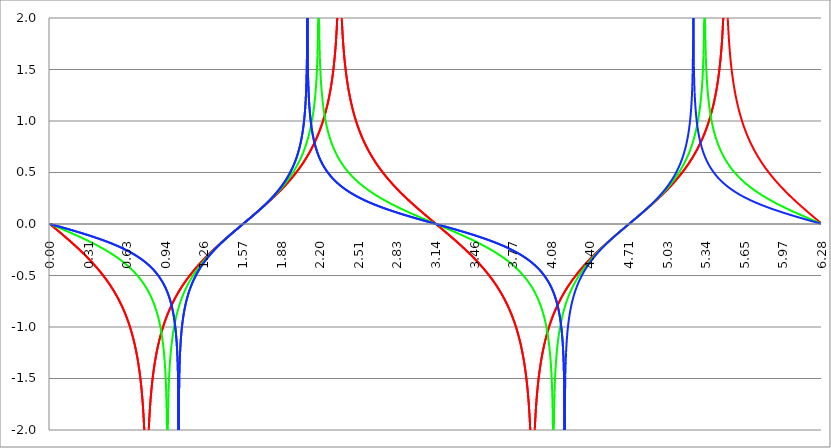
| Category | Series 1 | Series 0 | Series 2 |
|---|---|---|---|
| 0.0 | 0 | 0 | 0 |
| 0.00314159265358979 | -0.003 | -0.002 | -0.001 |
| 0.00628318530717958 | -0.006 | -0.003 | -0.002 |
| 0.00942477796076938 | -0.009 | -0.005 | -0.003 |
| 0.0125663706143592 | -0.013 | -0.006 | -0.004 |
| 0.015707963267949 | -0.016 | -0.008 | -0.005 |
| 0.0188495559215388 | -0.019 | -0.009 | -0.006 |
| 0.0219911485751285 | -0.022 | -0.011 | -0.007 |
| 0.0251327412287183 | -0.025 | -0.013 | -0.008 |
| 0.0282743338823081 | -0.028 | -0.014 | -0.009 |
| 0.0314159265358979 | -0.031 | -0.016 | -0.01 |
| 0.0345575191894877 | -0.035 | -0.017 | -0.012 |
| 0.0376991118430775 | -0.038 | -0.019 | -0.013 |
| 0.0408407044966673 | -0.041 | -0.02 | -0.014 |
| 0.0439822971502571 | -0.044 | -0.022 | -0.015 |
| 0.0471238898038469 | -0.047 | -0.024 | -0.016 |
| 0.0502654824574367 | -0.05 | -0.025 | -0.017 |
| 0.0534070751110265 | -0.054 | -0.027 | -0.018 |
| 0.0565486677646163 | -0.057 | -0.028 | -0.019 |
| 0.059690260418206 | -0.06 | -0.03 | -0.02 |
| 0.0628318530717958 | -0.063 | -0.031 | -0.021 |
| 0.0659734457253856 | -0.066 | -0.033 | -0.022 |
| 0.0691150383789754 | -0.069 | -0.035 | -0.023 |
| 0.0722566310325652 | -0.073 | -0.036 | -0.024 |
| 0.075398223686155 | -0.076 | -0.038 | -0.025 |
| 0.0785398163397448 | -0.079 | -0.039 | -0.026 |
| 0.0816814089933346 | -0.082 | -0.041 | -0.027 |
| 0.0848230016469244 | -0.085 | -0.043 | -0.028 |
| 0.0879645943005142 | -0.088 | -0.044 | -0.029 |
| 0.091106186954104 | -0.092 | -0.046 | -0.03 |
| 0.0942477796076937 | -0.095 | -0.047 | -0.032 |
| 0.0973893722612835 | -0.098 | -0.049 | -0.033 |
| 0.100530964914873 | -0.101 | -0.051 | -0.034 |
| 0.103672557568463 | -0.104 | -0.052 | -0.035 |
| 0.106814150222053 | -0.108 | -0.054 | -0.036 |
| 0.109955742875643 | -0.111 | -0.055 | -0.037 |
| 0.113097335529233 | -0.114 | -0.057 | -0.038 |
| 0.116238928182822 | -0.117 | -0.059 | -0.039 |
| 0.119380520836412 | -0.121 | -0.06 | -0.04 |
| 0.122522113490002 | -0.124 | -0.062 | -0.041 |
| 0.125663706143592 | -0.127 | -0.063 | -0.042 |
| 0.128805298797181 | -0.13 | -0.065 | -0.043 |
| 0.131946891450771 | -0.134 | -0.067 | -0.044 |
| 0.135088484104361 | -0.137 | -0.068 | -0.045 |
| 0.138230076757951 | -0.14 | -0.07 | -0.046 |
| 0.141371669411541 | -0.143 | -0.071 | -0.048 |
| 0.14451326206513 | -0.147 | -0.073 | -0.049 |
| 0.14765485471872 | -0.15 | -0.075 | -0.05 |
| 0.15079644737231 | -0.153 | -0.076 | -0.051 |
| 0.1539380400259 | -0.156 | -0.078 | -0.052 |
| 0.15707963267949 | -0.16 | -0.08 | -0.053 |
| 0.160221225333079 | -0.163 | -0.081 | -0.054 |
| 0.163362817986669 | -0.166 | -0.083 | -0.055 |
| 0.166504410640259 | -0.17 | -0.084 | -0.056 |
| 0.169646003293849 | -0.173 | -0.086 | -0.057 |
| 0.172787595947439 | -0.176 | -0.088 | -0.058 |
| 0.175929188601028 | -0.18 | -0.089 | -0.059 |
| 0.179070781254618 | -0.183 | -0.091 | -0.061 |
| 0.182212373908208 | -0.186 | -0.093 | -0.062 |
| 0.185353966561798 | -0.19 | -0.094 | -0.063 |
| 0.188495559215388 | -0.193 | -0.096 | -0.064 |
| 0.191637151868977 | -0.197 | -0.098 | -0.065 |
| 0.194778744522567 | -0.2 | -0.099 | -0.066 |
| 0.197920337176157 | -0.203 | -0.101 | -0.067 |
| 0.201061929829747 | -0.207 | -0.103 | -0.068 |
| 0.204203522483336 | -0.21 | -0.104 | -0.069 |
| 0.207345115136926 | -0.214 | -0.106 | -0.07 |
| 0.210486707790516 | -0.217 | -0.108 | -0.072 |
| 0.213628300444106 | -0.22 | -0.109 | -0.073 |
| 0.216769893097696 | -0.224 | -0.111 | -0.074 |
| 0.219911485751285 | -0.227 | -0.113 | -0.075 |
| 0.223053078404875 | -0.231 | -0.114 | -0.076 |
| 0.226194671058465 | -0.234 | -0.116 | -0.077 |
| 0.229336263712055 | -0.238 | -0.118 | -0.078 |
| 0.232477856365645 | -0.241 | -0.12 | -0.079 |
| 0.235619449019234 | -0.245 | -0.121 | -0.081 |
| 0.238761041672824 | -0.248 | -0.123 | -0.082 |
| 0.241902634326414 | -0.252 | -0.125 | -0.083 |
| 0.245044226980004 | -0.255 | -0.126 | -0.084 |
| 0.248185819633594 | -0.259 | -0.128 | -0.085 |
| 0.251327412287183 | -0.263 | -0.13 | -0.086 |
| 0.254469004940773 | -0.266 | -0.132 | -0.087 |
| 0.257610597594363 | -0.27 | -0.133 | -0.089 |
| 0.260752190247953 | -0.273 | -0.135 | -0.09 |
| 0.263893782901543 | -0.277 | -0.137 | -0.091 |
| 0.267035375555132 | -0.281 | -0.139 | -0.092 |
| 0.270176968208722 | -0.284 | -0.14 | -0.093 |
| 0.273318560862312 | -0.288 | -0.142 | -0.094 |
| 0.276460153515902 | -0.292 | -0.144 | -0.095 |
| 0.279601746169492 | -0.295 | -0.146 | -0.097 |
| 0.282743338823082 | -0.299 | -0.147 | -0.098 |
| 0.285884931476671 | -0.303 | -0.149 | -0.099 |
| 0.289026524130261 | -0.307 | -0.151 | -0.1 |
| 0.292168116783851 | -0.31 | -0.153 | -0.101 |
| 0.295309709437441 | -0.314 | -0.155 | -0.102 |
| 0.298451302091031 | -0.318 | -0.156 | -0.104 |
| 0.30159289474462 | -0.322 | -0.158 | -0.105 |
| 0.30473448739821 | -0.326 | -0.16 | -0.106 |
| 0.3078760800518 | -0.329 | -0.162 | -0.107 |
| 0.31101767270539 | -0.333 | -0.164 | -0.108 |
| 0.31415926535898 | -0.337 | -0.165 | -0.11 |
| 0.31730085801257 | -0.341 | -0.167 | -0.111 |
| 0.320442450666159 | -0.345 | -0.169 | -0.112 |
| 0.323584043319749 | -0.349 | -0.171 | -0.113 |
| 0.326725635973339 | -0.353 | -0.173 | -0.114 |
| 0.329867228626929 | -0.357 | -0.175 | -0.116 |
| 0.333008821280519 | -0.361 | -0.177 | -0.117 |
| 0.336150413934108 | -0.365 | -0.178 | -0.118 |
| 0.339292006587698 | -0.369 | -0.18 | -0.119 |
| 0.342433599241288 | -0.373 | -0.182 | -0.121 |
| 0.345575191894878 | -0.377 | -0.184 | -0.122 |
| 0.348716784548468 | -0.381 | -0.186 | -0.123 |
| 0.351858377202058 | -0.385 | -0.188 | -0.124 |
| 0.354999969855647 | -0.389 | -0.19 | -0.126 |
| 0.358141562509237 | -0.393 | -0.192 | -0.127 |
| 0.361283155162827 | -0.398 | -0.194 | -0.128 |
| 0.364424747816417 | -0.402 | -0.196 | -0.129 |
| 0.367566340470007 | -0.406 | -0.198 | -0.131 |
| 0.370707933123597 | -0.41 | -0.199 | -0.132 |
| 0.373849525777186 | -0.415 | -0.201 | -0.133 |
| 0.376991118430776 | -0.419 | -0.203 | -0.134 |
| 0.380132711084366 | -0.423 | -0.205 | -0.136 |
| 0.383274303737956 | -0.427 | -0.207 | -0.137 |
| 0.386415896391546 | -0.432 | -0.209 | -0.138 |
| 0.389557489045135 | -0.436 | -0.211 | -0.139 |
| 0.392699081698725 | -0.441 | -0.213 | -0.141 |
| 0.395840674352315 | -0.445 | -0.215 | -0.142 |
| 0.398982267005905 | -0.45 | -0.217 | -0.143 |
| 0.402123859659495 | -0.454 | -0.219 | -0.145 |
| 0.405265452313085 | -0.459 | -0.221 | -0.146 |
| 0.408407044966674 | -0.463 | -0.224 | -0.147 |
| 0.411548637620264 | -0.468 | -0.226 | -0.149 |
| 0.414690230273854 | -0.473 | -0.228 | -0.15 |
| 0.417831822927444 | -0.477 | -0.23 | -0.151 |
| 0.420973415581034 | -0.482 | -0.232 | -0.153 |
| 0.424115008234623 | -0.487 | -0.234 | -0.154 |
| 0.427256600888213 | -0.491 | -0.236 | -0.155 |
| 0.430398193541803 | -0.496 | -0.238 | -0.157 |
| 0.433539786195393 | -0.501 | -0.24 | -0.158 |
| 0.436681378848983 | -0.506 | -0.242 | -0.16 |
| 0.439822971502573 | -0.511 | -0.245 | -0.161 |
| 0.442964564156162 | -0.516 | -0.247 | -0.162 |
| 0.446106156809752 | -0.521 | -0.249 | -0.164 |
| 0.449247749463342 | -0.526 | -0.251 | -0.165 |
| 0.452389342116932 | -0.531 | -0.253 | -0.166 |
| 0.455530934770522 | -0.536 | -0.256 | -0.168 |
| 0.458672527424111 | -0.541 | -0.258 | -0.169 |
| 0.461814120077701 | -0.546 | -0.26 | -0.171 |
| 0.464955712731291 | -0.551 | -0.262 | -0.172 |
| 0.468097305384881 | -0.557 | -0.264 | -0.174 |
| 0.471238898038471 | -0.562 | -0.267 | -0.175 |
| 0.474380490692061 | -0.567 | -0.269 | -0.176 |
| 0.47752208334565 | -0.573 | -0.271 | -0.178 |
| 0.48066367599924 | -0.578 | -0.274 | -0.179 |
| 0.48380526865283 | -0.584 | -0.276 | -0.181 |
| 0.48694686130642 | -0.589 | -0.278 | -0.182 |
| 0.49008845396001 | -0.595 | -0.281 | -0.184 |
| 0.493230046613599 | -0.601 | -0.283 | -0.185 |
| 0.496371639267189 | -0.606 | -0.285 | -0.187 |
| 0.499513231920779 | -0.612 | -0.288 | -0.188 |
| 0.502654824574369 | -0.618 | -0.29 | -0.19 |
| 0.505796417227959 | -0.624 | -0.293 | -0.191 |
| 0.508938009881549 | -0.63 | -0.295 | -0.193 |
| 0.512079602535138 | -0.636 | -0.297 | -0.194 |
| 0.515221195188728 | -0.642 | -0.3 | -0.196 |
| 0.518362787842318 | -0.648 | -0.302 | -0.197 |
| 0.521504380495908 | -0.654 | -0.305 | -0.199 |
| 0.524645973149498 | -0.661 | -0.307 | -0.201 |
| 0.527787565803087 | -0.667 | -0.31 | -0.202 |
| 0.530929158456677 | -0.673 | -0.312 | -0.204 |
| 0.534070751110267 | -0.68 | -0.315 | -0.205 |
| 0.537212343763857 | -0.686 | -0.318 | -0.207 |
| 0.540353936417447 | -0.693 | -0.32 | -0.209 |
| 0.543495529071037 | -0.7 | -0.323 | -0.21 |
| 0.546637121724626 | -0.707 | -0.325 | -0.212 |
| 0.549778714378216 | -0.713 | -0.328 | -0.213 |
| 0.552920307031806 | -0.72 | -0.331 | -0.215 |
| 0.556061899685396 | -0.727 | -0.333 | -0.217 |
| 0.559203492338986 | -0.735 | -0.336 | -0.218 |
| 0.562345084992576 | -0.742 | -0.339 | -0.22 |
| 0.565486677646165 | -0.749 | -0.342 | -0.222 |
| 0.568628270299755 | -0.757 | -0.344 | -0.224 |
| 0.571769862953345 | -0.764 | -0.347 | -0.225 |
| 0.574911455606935 | -0.772 | -0.35 | -0.227 |
| 0.578053048260525 | -0.779 | -0.353 | -0.229 |
| 0.581194640914114 | -0.787 | -0.356 | -0.23 |
| 0.584336233567704 | -0.795 | -0.359 | -0.232 |
| 0.587477826221294 | -0.803 | -0.361 | -0.234 |
| 0.590619418874884 | -0.812 | -0.364 | -0.236 |
| 0.593761011528474 | -0.82 | -0.367 | -0.238 |
| 0.596902604182064 | -0.828 | -0.37 | -0.239 |
| 0.600044196835653 | -0.837 | -0.373 | -0.241 |
| 0.603185789489243 | -0.846 | -0.376 | -0.243 |
| 0.606327382142833 | -0.855 | -0.379 | -0.245 |
| 0.609468974796423 | -0.864 | -0.382 | -0.247 |
| 0.612610567450013 | -0.873 | -0.386 | -0.249 |
| 0.615752160103602 | -0.882 | -0.389 | -0.25 |
| 0.618893752757192 | -0.892 | -0.392 | -0.252 |
| 0.622035345410782 | -0.901 | -0.395 | -0.254 |
| 0.625176938064372 | -0.911 | -0.398 | -0.256 |
| 0.628318530717962 | -0.921 | -0.401 | -0.258 |
| 0.631460123371551 | -0.932 | -0.405 | -0.26 |
| 0.634601716025141 | -0.942 | -0.408 | -0.262 |
| 0.637743308678731 | -0.953 | -0.411 | -0.264 |
| 0.640884901332321 | -0.964 | -0.415 | -0.266 |
| 0.644026493985911 | -0.975 | -0.418 | -0.268 |
| 0.647168086639501 | -0.986 | -0.422 | -0.27 |
| 0.65030967929309 | -0.998 | -0.425 | -0.272 |
| 0.65345127194668 | -1.01 | -0.429 | -0.274 |
| 0.65659286460027 | -1.022 | -0.432 | -0.276 |
| 0.65973445725386 | -1.034 | -0.436 | -0.278 |
| 0.66287604990745 | -1.047 | -0.439 | -0.28 |
| 0.666017642561039 | -1.06 | -0.443 | -0.283 |
| 0.669159235214629 | -1.074 | -0.447 | -0.285 |
| 0.672300827868219 | -1.088 | -0.45 | -0.287 |
| 0.675442420521809 | -1.102 | -0.454 | -0.289 |
| 0.678584013175399 | -1.116 | -0.458 | -0.291 |
| 0.681725605828989 | -1.131 | -0.462 | -0.293 |
| 0.684867198482578 | -1.147 | -0.466 | -0.296 |
| 0.688008791136168 | -1.163 | -0.47 | -0.298 |
| 0.691150383789758 | -1.179 | -0.474 | -0.3 |
| 0.694291976443348 | -1.196 | -0.478 | -0.302 |
| 0.697433569096938 | -1.214 | -0.482 | -0.305 |
| 0.700575161750528 | -1.232 | -0.486 | -0.307 |
| 0.703716754404117 | -1.251 | -0.49 | -0.309 |
| 0.706858347057707 | -1.271 | -0.494 | -0.312 |
| 0.709999939711297 | -1.292 | -0.499 | -0.314 |
| 0.713141532364887 | -1.313 | -0.503 | -0.317 |
| 0.716283125018477 | -1.335 | -0.508 | -0.319 |
| 0.719424717672066 | -1.359 | -0.512 | -0.322 |
| 0.722566310325656 | -1.383 | -0.517 | -0.324 |
| 0.725707902979246 | -1.409 | -0.521 | -0.327 |
| 0.728849495632836 | -1.436 | -0.526 | -0.329 |
| 0.731991088286426 | -1.464 | -0.531 | -0.332 |
| 0.735132680940016 | -1.495 | -0.535 | -0.334 |
| 0.738274273593605 | -1.527 | -0.54 | -0.337 |
| 0.741415866247195 | -1.562 | -0.545 | -0.34 |
| 0.744557458900785 | -1.599 | -0.55 | -0.342 |
| 0.747699051554375 | -1.639 | -0.555 | -0.345 |
| 0.750840644207965 | -1.682 | -0.56 | -0.348 |
| 0.753982236861554 | -1.73 | -0.566 | -0.351 |
| 0.757123829515144 | -1.783 | -0.571 | -0.353 |
| 0.760265422168734 | -1.842 | -0.576 | -0.356 |
| 0.763407014822324 | -1.908 | -0.582 | -0.359 |
| 0.766548607475914 | -1.986 | -0.588 | -0.362 |
| 0.769690200129504 | -2.077 | -0.593 | -0.365 |
| 0.772831792783093 | -2.188 | -0.599 | -0.368 |
| 0.775973385436683 | -2.332 | -0.605 | -0.371 |
| 0.779114978090273 | -2.535 | -0.611 | -0.374 |
| 0.782256570743863 | -2.882 | -0.617 | -0.377 |
| 0.785398163397453 | -16.524 | -0.623 | -0.38 |
| 0.788539756051042 | -2.882 | -0.63 | -0.383 |
| 0.791681348704632 | -2.535 | -0.636 | -0.387 |
| 0.794822941358222 | -2.332 | -0.643 | -0.39 |
| 0.797964534011812 | -2.188 | -0.649 | -0.393 |
| 0.801106126665402 | -2.077 | -0.656 | -0.396 |
| 0.804247719318992 | -1.986 | -0.663 | -0.4 |
| 0.807389311972581 | -1.908 | -0.67 | -0.403 |
| 0.810530904626171 | -1.842 | -0.678 | -0.407 |
| 0.813672497279761 | -1.783 | -0.685 | -0.41 |
| 0.816814089933351 | -1.73 | -0.693 | -0.414 |
| 0.819955682586941 | -1.682 | -0.701 | -0.417 |
| 0.823097275240531 | -1.639 | -0.709 | -0.421 |
| 0.82623886789412 | -1.599 | -0.717 | -0.425 |
| 0.82938046054771 | -1.562 | -0.725 | -0.429 |
| 0.8325220532013 | -1.527 | -0.734 | -0.432 |
| 0.83566364585489 | -1.495 | -0.743 | -0.436 |
| 0.83880523850848 | -1.464 | -0.752 | -0.44 |
| 0.841946831162069 | -1.436 | -0.761 | -0.444 |
| 0.845088423815659 | -1.409 | -0.771 | -0.448 |
| 0.848230016469249 | -1.383 | -0.781 | -0.453 |
| 0.851371609122839 | -1.359 | -0.791 | -0.457 |
| 0.854513201776429 | -1.335 | -0.802 | -0.461 |
| 0.857654794430019 | -1.313 | -0.813 | -0.465 |
| 0.860796387083608 | -1.292 | -0.824 | -0.47 |
| 0.863937979737198 | -1.271 | -0.835 | -0.474 |
| 0.867079572390788 | -1.251 | -0.847 | -0.479 |
| 0.870221165044378 | -1.232 | -0.86 | -0.484 |
| 0.873362757697968 | -1.214 | -0.873 | -0.489 |
| 0.876504350351557 | -1.196 | -0.886 | -0.493 |
| 0.879645943005147 | -1.179 | -0.901 | -0.498 |
| 0.882787535658737 | -1.163 | -0.915 | -0.503 |
| 0.885929128312327 | -1.147 | -0.93 | -0.509 |
| 0.889070720965917 | -1.131 | -0.947 | -0.514 |
| 0.892212313619507 | -1.116 | -0.963 | -0.519 |
| 0.895353906273096 | -1.102 | -0.981 | -0.525 |
| 0.898495498926686 | -1.088 | -1 | -0.53 |
| 0.901637091580276 | -1.074 | -1.02 | -0.536 |
| 0.904778684233866 | -1.06 | -1.041 | -0.542 |
| 0.907920276887456 | -1.047 | -1.063 | -0.548 |
| 0.911061869541045 | -1.034 | -1.087 | -0.554 |
| 0.914203462194635 | -1.022 | -1.112 | -0.561 |
| 0.917345054848225 | -1.01 | -1.14 | -0.567 |
| 0.920486647501815 | -0.998 | -1.17 | -0.574 |
| 0.923628240155405 | -0.986 | -1.203 | -0.581 |
| 0.926769832808995 | -0.975 | -1.24 | -0.588 |
| 0.929911425462584 | -0.964 | -1.281 | -0.595 |
| 0.933053018116174 | -0.953 | -1.327 | -0.602 |
| 0.936194610769764 | -0.942 | -1.38 | -0.61 |
| 0.939336203423354 | -0.932 | -1.444 | -0.618 |
| 0.942477796076944 | -0.921 | -1.521 | -0.626 |
| 0.945619388730533 | -0.911 | -1.619 | -0.634 |
| 0.948760981384123 | -0.901 | -1.757 | -0.643 |
| 0.951902574037713 | -0.892 | -1.988 | -0.652 |
| 0.955044166691303 | -0.882 | -2.881 | -0.661 |
| 0.958185759344893 | -0.873 | -2.048 | -0.671 |
| 0.961327351998483 | -0.864 | -1.787 | -0.68 |
| 0.964468944652072 | -0.855 | -1.638 | -0.691 |
| 0.967610537305662 | -0.846 | -1.533 | -0.701 |
| 0.970752129959252 | -0.837 | -1.452 | -0.713 |
| 0.973893722612842 | -0.828 | -1.386 | -0.724 |
| 0.977035315266432 | -0.82 | -1.33 | -0.736 |
| 0.980176907920022 | -0.812 | -1.282 | -0.749 |
| 0.983318500573611 | -0.803 | -1.24 | -0.763 |
| 0.986460093227201 | -0.795 | -1.202 | -0.777 |
| 0.989601685880791 | -0.787 | -1.167 | -0.792 |
| 0.992743278534381 | -0.779 | -1.136 | -0.807 |
| 0.995884871187971 | -0.772 | -1.107 | -0.824 |
| 0.99902646384156 | -0.764 | -1.08 | -0.842 |
| 1.00216805649515 | -0.757 | -1.055 | -0.861 |
| 1.00530964914874 | -0.749 | -1.032 | -0.881 |
| 1.00845124180233 | -0.742 | -1.01 | -0.903 |
| 1.01159283445592 | -0.735 | -0.989 | -0.927 |
| 1.01473442710951 | -0.727 | -0.969 | -0.953 |
| 1.017876019763099 | -0.72 | -0.951 | -0.982 |
| 1.021017612416689 | -0.713 | -0.933 | -1.014 |
| 1.02415920507028 | -0.707 | -0.916 | -1.051 |
| 1.027300797723869 | -0.7 | -0.9 | -1.093 |
| 1.030442390377459 | -0.693 | -0.884 | -1.142 |
| 1.033583983031048 | -0.686 | -0.869 | -1.201 |
| 1.036725575684638 | -0.68 | -0.855 | -1.276 |
| 1.039867168338228 | -0.673 | -0.841 | -1.379 |
| 1.043008760991818 | -0.667 | -0.828 | -1.54 |
| 1.046150353645408 | -0.661 | -0.815 | -3 |
| 1.049291946298998 | -0.654 | -0.802 | -1.739 |
| 1.052433538952587 | -0.648 | -0.79 | -1.474 |
| 1.055575131606177 | -0.642 | -0.778 | -1.338 |
| 1.058716724259767 | -0.636 | -0.767 | -1.245 |
| 1.061858316913357 | -0.63 | -0.756 | -1.175 |
| 1.064999909566947 | -0.624 | -0.745 | -1.118 |
| 1.068141502220536 | -0.618 | -0.735 | -1.071 |
| 1.071283094874126 | -0.612 | -0.724 | -1.03 |
| 1.074424687527716 | -0.606 | -0.714 | -0.994 |
| 1.077566280181306 | -0.601 | -0.705 | -0.962 |
| 1.080707872834896 | -0.595 | -0.695 | -0.933 |
| 1.083849465488486 | -0.589 | -0.686 | -0.907 |
| 1.086991058142075 | -0.584 | -0.677 | -0.882 |
| 1.090132650795665 | -0.578 | -0.668 | -0.86 |
| 1.093274243449255 | -0.573 | -0.659 | -0.839 |
| 1.096415836102845 | -0.567 | -0.651 | -0.819 |
| 1.099557428756435 | -0.562 | -0.643 | -0.801 |
| 1.102699021410025 | -0.557 | -0.635 | -0.783 |
| 1.105840614063614 | -0.551 | -0.627 | -0.767 |
| 1.108982206717204 | -0.546 | -0.619 | -0.751 |
| 1.112123799370794 | -0.541 | -0.611 | -0.736 |
| 1.115265392024384 | -0.536 | -0.603 | -0.722 |
| 1.118406984677974 | -0.531 | -0.596 | -0.709 |
| 1.121548577331563 | -0.526 | -0.589 | -0.696 |
| 1.124690169985153 | -0.521 | -0.582 | -0.683 |
| 1.127831762638743 | -0.516 | -0.574 | -0.671 |
| 1.130973355292333 | -0.511 | -0.568 | -0.659 |
| 1.134114947945923 | -0.506 | -0.561 | -0.648 |
| 1.137256540599513 | -0.501 | -0.554 | -0.637 |
| 1.140398133253102 | -0.496 | -0.547 | -0.627 |
| 1.143539725906692 | -0.491 | -0.541 | -0.616 |
| 1.146681318560282 | -0.487 | -0.534 | -0.607 |
| 1.149822911213872 | -0.482 | -0.528 | -0.597 |
| 1.152964503867462 | -0.477 | -0.522 | -0.588 |
| 1.156106096521051 | -0.473 | -0.516 | -0.579 |
| 1.159247689174641 | -0.468 | -0.51 | -0.57 |
| 1.162389281828231 | -0.463 | -0.504 | -0.561 |
| 1.165530874481821 | -0.459 | -0.498 | -0.553 |
| 1.168672467135411 | -0.454 | -0.492 | -0.544 |
| 1.171814059789001 | -0.45 | -0.486 | -0.536 |
| 1.17495565244259 | -0.445 | -0.48 | -0.529 |
| 1.17809724509618 | -0.441 | -0.475 | -0.521 |
| 1.18123883774977 | -0.436 | -0.469 | -0.513 |
| 1.18438043040336 | -0.432 | -0.464 | -0.506 |
| 1.18752202305695 | -0.427 | -0.458 | -0.499 |
| 1.190663615710539 | -0.423 | -0.453 | -0.492 |
| 1.193805208364129 | -0.419 | -0.447 | -0.485 |
| 1.19694680101772 | -0.415 | -0.442 | -0.478 |
| 1.200088393671309 | -0.41 | -0.437 | -0.471 |
| 1.203229986324899 | -0.406 | -0.432 | -0.465 |
| 1.206371578978489 | -0.402 | -0.427 | -0.458 |
| 1.209513171632078 | -0.398 | -0.422 | -0.452 |
| 1.212654764285668 | -0.393 | -0.417 | -0.446 |
| 1.215796356939258 | -0.389 | -0.412 | -0.44 |
| 1.218937949592848 | -0.385 | -0.407 | -0.434 |
| 1.222079542246438 | -0.381 | -0.402 | -0.428 |
| 1.225221134900027 | -0.377 | -0.397 | -0.422 |
| 1.228362727553617 | -0.373 | -0.392 | -0.416 |
| 1.231504320207207 | -0.369 | -0.388 | -0.411 |
| 1.234645912860797 | -0.365 | -0.383 | -0.405 |
| 1.237787505514387 | -0.361 | -0.378 | -0.399 |
| 1.240929098167977 | -0.357 | -0.374 | -0.394 |
| 1.244070690821566 | -0.353 | -0.369 | -0.389 |
| 1.247212283475156 | -0.349 | -0.365 | -0.383 |
| 1.250353876128746 | -0.345 | -0.36 | -0.378 |
| 1.253495468782336 | -0.341 | -0.356 | -0.373 |
| 1.256637061435926 | -0.337 | -0.351 | -0.368 |
| 1.259778654089515 | -0.333 | -0.347 | -0.363 |
| 1.262920246743105 | -0.329 | -0.342 | -0.358 |
| 1.266061839396695 | -0.326 | -0.338 | -0.353 |
| 1.269203432050285 | -0.322 | -0.334 | -0.348 |
| 1.272345024703875 | -0.318 | -0.33 | -0.343 |
| 1.275486617357465 | -0.314 | -0.325 | -0.338 |
| 1.278628210011054 | -0.31 | -0.321 | -0.334 |
| 1.281769802664644 | -0.307 | -0.317 | -0.329 |
| 1.284911395318234 | -0.303 | -0.313 | -0.324 |
| 1.288052987971824 | -0.299 | -0.309 | -0.32 |
| 1.291194580625414 | -0.295 | -0.305 | -0.315 |
| 1.294336173279003 | -0.292 | -0.301 | -0.311 |
| 1.297477765932593 | -0.288 | -0.297 | -0.306 |
| 1.300619358586183 | -0.284 | -0.293 | -0.302 |
| 1.303760951239773 | -0.281 | -0.289 | -0.297 |
| 1.306902543893363 | -0.277 | -0.285 | -0.293 |
| 1.310044136546953 | -0.273 | -0.281 | -0.289 |
| 1.313185729200542 | -0.27 | -0.277 | -0.284 |
| 1.316327321854132 | -0.266 | -0.273 | -0.28 |
| 1.319468914507722 | -0.263 | -0.269 | -0.276 |
| 1.322610507161312 | -0.259 | -0.265 | -0.272 |
| 1.325752099814902 | -0.255 | -0.261 | -0.268 |
| 1.328893692468491 | -0.252 | -0.258 | -0.264 |
| 1.332035285122081 | -0.248 | -0.254 | -0.26 |
| 1.335176877775671 | -0.245 | -0.25 | -0.256 |
| 1.338318470429261 | -0.241 | -0.246 | -0.252 |
| 1.341460063082851 | -0.238 | -0.243 | -0.248 |
| 1.344601655736441 | -0.234 | -0.239 | -0.244 |
| 1.34774324839003 | -0.231 | -0.235 | -0.24 |
| 1.35088484104362 | -0.227 | -0.231 | -0.236 |
| 1.35402643369721 | -0.224 | -0.228 | -0.232 |
| 1.3571680263508 | -0.22 | -0.224 | -0.228 |
| 1.36030961900439 | -0.217 | -0.221 | -0.224 |
| 1.363451211657979 | -0.214 | -0.217 | -0.22 |
| 1.36659280431157 | -0.21 | -0.213 | -0.217 |
| 1.369734396965159 | -0.207 | -0.21 | -0.213 |
| 1.372875989618749 | -0.203 | -0.206 | -0.209 |
| 1.376017582272339 | -0.2 | -0.203 | -0.206 |
| 1.379159174925929 | -0.197 | -0.199 | -0.202 |
| 1.382300767579518 | -0.193 | -0.196 | -0.198 |
| 1.385442360233108 | -0.19 | -0.192 | -0.195 |
| 1.388583952886698 | -0.186 | -0.189 | -0.191 |
| 1.391725545540288 | -0.183 | -0.185 | -0.187 |
| 1.394867138193878 | -0.18 | -0.182 | -0.184 |
| 1.398008730847468 | -0.176 | -0.178 | -0.18 |
| 1.401150323501057 | -0.173 | -0.175 | -0.177 |
| 1.404291916154647 | -0.17 | -0.171 | -0.173 |
| 1.407433508808237 | -0.166 | -0.168 | -0.17 |
| 1.410575101461827 | -0.163 | -0.165 | -0.166 |
| 1.413716694115417 | -0.16 | -0.161 | -0.163 |
| 1.416858286769006 | -0.156 | -0.158 | -0.159 |
| 1.419999879422596 | -0.153 | -0.154 | -0.156 |
| 1.423141472076186 | -0.15 | -0.151 | -0.152 |
| 1.426283064729776 | -0.147 | -0.148 | -0.149 |
| 1.429424657383366 | -0.143 | -0.144 | -0.145 |
| 1.432566250036956 | -0.14 | -0.141 | -0.142 |
| 1.435707842690545 | -0.137 | -0.138 | -0.139 |
| 1.438849435344135 | -0.134 | -0.134 | -0.135 |
| 1.441991027997725 | -0.13 | -0.131 | -0.132 |
| 1.445132620651315 | -0.127 | -0.128 | -0.128 |
| 1.448274213304905 | -0.124 | -0.124 | -0.125 |
| 1.451415805958494 | -0.121 | -0.121 | -0.122 |
| 1.454557398612084 | -0.117 | -0.118 | -0.118 |
| 1.457698991265674 | -0.114 | -0.115 | -0.115 |
| 1.460840583919264 | -0.111 | -0.111 | -0.112 |
| 1.463982176572854 | -0.108 | -0.108 | -0.108 |
| 1.467123769226444 | -0.104 | -0.105 | -0.105 |
| 1.470265361880033 | -0.101 | -0.102 | -0.102 |
| 1.473406954533623 | -0.098 | -0.098 | -0.099 |
| 1.476548547187213 | -0.095 | -0.095 | -0.095 |
| 1.479690139840803 | -0.092 | -0.092 | -0.092 |
| 1.482831732494393 | -0.088 | -0.089 | -0.089 |
| 1.485973325147982 | -0.085 | -0.085 | -0.086 |
| 1.489114917801572 | -0.082 | -0.082 | -0.082 |
| 1.492256510455162 | -0.079 | -0.079 | -0.079 |
| 1.495398103108752 | -0.076 | -0.076 | -0.076 |
| 1.498539695762342 | -0.073 | -0.073 | -0.073 |
| 1.501681288415932 | -0.069 | -0.069 | -0.07 |
| 1.504822881069521 | -0.066 | -0.066 | -0.066 |
| 1.507964473723111 | -0.063 | -0.063 | -0.063 |
| 1.511106066376701 | -0.06 | -0.06 | -0.06 |
| 1.514247659030291 | -0.057 | -0.057 | -0.057 |
| 1.517389251683881 | -0.054 | -0.054 | -0.054 |
| 1.520530844337471 | -0.05 | -0.05 | -0.05 |
| 1.52367243699106 | -0.047 | -0.047 | -0.047 |
| 1.52681402964465 | -0.044 | -0.044 | -0.044 |
| 1.52995562229824 | -0.041 | -0.041 | -0.041 |
| 1.53309721495183 | -0.038 | -0.038 | -0.038 |
| 1.53623880760542 | -0.035 | -0.035 | -0.035 |
| 1.539380400259009 | -0.031 | -0.031 | -0.031 |
| 1.542521992912599 | -0.028 | -0.028 | -0.028 |
| 1.545663585566189 | -0.025 | -0.025 | -0.025 |
| 1.548805178219779 | -0.022 | -0.022 | -0.022 |
| 1.551946770873369 | -0.019 | -0.019 | -0.019 |
| 1.555088363526959 | -0.016 | -0.016 | -0.016 |
| 1.558229956180548 | -0.013 | -0.013 | -0.013 |
| 1.561371548834138 | -0.009 | -0.009 | -0.009 |
| 1.564513141487728 | -0.006 | -0.006 | -0.006 |
| 1.567654734141318 | -0.003 | -0.003 | -0.003 |
| 1.570796326794908 | 0 | 0 | 0 |
| 1.573937919448497 | 0.003 | 0.003 | 0.003 |
| 1.577079512102087 | 0.006 | 0.006 | 0.006 |
| 1.580221104755677 | 0.009 | 0.009 | 0.009 |
| 1.583362697409267 | 0.013 | 0.013 | 0.013 |
| 1.586504290062857 | 0.016 | 0.016 | 0.016 |
| 1.589645882716447 | 0.019 | 0.019 | 0.019 |
| 1.592787475370036 | 0.022 | 0.022 | 0.022 |
| 1.595929068023626 | 0.025 | 0.025 | 0.025 |
| 1.599070660677216 | 0.028 | 0.028 | 0.028 |
| 1.602212253330806 | 0.031 | 0.031 | 0.031 |
| 1.605353845984396 | 0.035 | 0.035 | 0.035 |
| 1.608495438637985 | 0.038 | 0.038 | 0.038 |
| 1.611637031291575 | 0.041 | 0.041 | 0.041 |
| 1.614778623945165 | 0.044 | 0.044 | 0.044 |
| 1.617920216598755 | 0.047 | 0.047 | 0.047 |
| 1.621061809252345 | 0.05 | 0.05 | 0.05 |
| 1.624203401905935 | 0.054 | 0.054 | 0.054 |
| 1.627344994559524 | 0.057 | 0.057 | 0.057 |
| 1.630486587213114 | 0.06 | 0.06 | 0.06 |
| 1.633628179866704 | 0.063 | 0.063 | 0.063 |
| 1.636769772520294 | 0.066 | 0.066 | 0.066 |
| 1.639911365173884 | 0.069 | 0.069 | 0.07 |
| 1.643052957827473 | 0.073 | 0.073 | 0.073 |
| 1.646194550481063 | 0.076 | 0.076 | 0.076 |
| 1.649336143134653 | 0.079 | 0.079 | 0.079 |
| 1.652477735788243 | 0.082 | 0.082 | 0.082 |
| 1.655619328441833 | 0.085 | 0.085 | 0.086 |
| 1.658760921095423 | 0.088 | 0.089 | 0.089 |
| 1.661902513749012 | 0.092 | 0.092 | 0.092 |
| 1.665044106402602 | 0.095 | 0.095 | 0.095 |
| 1.668185699056192 | 0.098 | 0.098 | 0.099 |
| 1.671327291709782 | 0.101 | 0.102 | 0.102 |
| 1.674468884363372 | 0.104 | 0.105 | 0.105 |
| 1.677610477016961 | 0.108 | 0.108 | 0.108 |
| 1.680752069670551 | 0.111 | 0.111 | 0.112 |
| 1.683893662324141 | 0.114 | 0.115 | 0.115 |
| 1.687035254977731 | 0.117 | 0.118 | 0.118 |
| 1.690176847631321 | 0.121 | 0.121 | 0.122 |
| 1.693318440284911 | 0.124 | 0.124 | 0.125 |
| 1.6964600329385 | 0.127 | 0.128 | 0.128 |
| 1.69960162559209 | 0.13 | 0.131 | 0.132 |
| 1.70274321824568 | 0.134 | 0.134 | 0.135 |
| 1.70588481089927 | 0.137 | 0.138 | 0.139 |
| 1.70902640355286 | 0.14 | 0.141 | 0.142 |
| 1.712167996206449 | 0.143 | 0.144 | 0.145 |
| 1.715309588860039 | 0.147 | 0.148 | 0.149 |
| 1.71845118151363 | 0.15 | 0.151 | 0.152 |
| 1.721592774167219 | 0.153 | 0.154 | 0.156 |
| 1.724734366820809 | 0.156 | 0.158 | 0.159 |
| 1.727875959474399 | 0.16 | 0.161 | 0.163 |
| 1.731017552127988 | 0.163 | 0.165 | 0.166 |
| 1.734159144781578 | 0.166 | 0.168 | 0.17 |
| 1.737300737435168 | 0.17 | 0.171 | 0.173 |
| 1.740442330088758 | 0.173 | 0.175 | 0.177 |
| 1.743583922742348 | 0.176 | 0.178 | 0.18 |
| 1.746725515395937 | 0.18 | 0.182 | 0.184 |
| 1.749867108049527 | 0.183 | 0.185 | 0.187 |
| 1.753008700703117 | 0.186 | 0.189 | 0.191 |
| 1.756150293356707 | 0.19 | 0.192 | 0.195 |
| 1.759291886010297 | 0.193 | 0.196 | 0.198 |
| 1.762433478663887 | 0.197 | 0.199 | 0.202 |
| 1.765575071317476 | 0.2 | 0.203 | 0.206 |
| 1.768716663971066 | 0.203 | 0.206 | 0.209 |
| 1.771858256624656 | 0.207 | 0.21 | 0.213 |
| 1.774999849278246 | 0.21 | 0.213 | 0.217 |
| 1.778141441931836 | 0.214 | 0.217 | 0.22 |
| 1.781283034585426 | 0.217 | 0.221 | 0.224 |
| 1.784424627239015 | 0.22 | 0.224 | 0.228 |
| 1.787566219892605 | 0.224 | 0.228 | 0.232 |
| 1.790707812546195 | 0.227 | 0.231 | 0.236 |
| 1.793849405199785 | 0.231 | 0.235 | 0.24 |
| 1.796990997853375 | 0.234 | 0.239 | 0.244 |
| 1.800132590506964 | 0.238 | 0.243 | 0.248 |
| 1.803274183160554 | 0.241 | 0.246 | 0.252 |
| 1.806415775814144 | 0.245 | 0.25 | 0.256 |
| 1.809557368467734 | 0.248 | 0.254 | 0.26 |
| 1.812698961121324 | 0.252 | 0.258 | 0.264 |
| 1.815840553774914 | 0.255 | 0.261 | 0.268 |
| 1.818982146428503 | 0.259 | 0.265 | 0.272 |
| 1.822123739082093 | 0.263 | 0.269 | 0.276 |
| 1.825265331735683 | 0.266 | 0.273 | 0.28 |
| 1.828406924389273 | 0.27 | 0.277 | 0.284 |
| 1.831548517042863 | 0.273 | 0.281 | 0.289 |
| 1.834690109696452 | 0.277 | 0.285 | 0.293 |
| 1.837831702350042 | 0.281 | 0.289 | 0.297 |
| 1.840973295003632 | 0.284 | 0.293 | 0.302 |
| 1.844114887657222 | 0.288 | 0.297 | 0.306 |
| 1.847256480310812 | 0.292 | 0.301 | 0.311 |
| 1.850398072964402 | 0.295 | 0.305 | 0.315 |
| 1.853539665617991 | 0.299 | 0.309 | 0.32 |
| 1.856681258271581 | 0.303 | 0.313 | 0.324 |
| 1.859822850925171 | 0.307 | 0.317 | 0.329 |
| 1.862964443578761 | 0.31 | 0.321 | 0.334 |
| 1.866106036232351 | 0.314 | 0.325 | 0.338 |
| 1.86924762888594 | 0.318 | 0.33 | 0.343 |
| 1.87238922153953 | 0.322 | 0.334 | 0.348 |
| 1.87553081419312 | 0.326 | 0.338 | 0.353 |
| 1.87867240684671 | 0.329 | 0.342 | 0.358 |
| 1.8818139995003 | 0.333 | 0.347 | 0.363 |
| 1.88495559215389 | 0.337 | 0.351 | 0.368 |
| 1.888097184807479 | 0.341 | 0.356 | 0.373 |
| 1.891238777461069 | 0.345 | 0.36 | 0.378 |
| 1.89438037011466 | 0.349 | 0.365 | 0.383 |
| 1.897521962768249 | 0.353 | 0.369 | 0.389 |
| 1.900663555421839 | 0.357 | 0.374 | 0.394 |
| 1.903805148075429 | 0.361 | 0.378 | 0.399 |
| 1.906946740729018 | 0.365 | 0.383 | 0.405 |
| 1.910088333382608 | 0.369 | 0.388 | 0.411 |
| 1.913229926036198 | 0.373 | 0.392 | 0.416 |
| 1.916371518689788 | 0.377 | 0.397 | 0.422 |
| 1.919513111343378 | 0.381 | 0.402 | 0.428 |
| 1.922654703996967 | 0.385 | 0.407 | 0.434 |
| 1.925796296650557 | 0.389 | 0.412 | 0.44 |
| 1.928937889304147 | 0.393 | 0.417 | 0.446 |
| 1.932079481957737 | 0.398 | 0.422 | 0.452 |
| 1.935221074611327 | 0.402 | 0.427 | 0.458 |
| 1.938362667264917 | 0.406 | 0.432 | 0.465 |
| 1.941504259918506 | 0.41 | 0.437 | 0.471 |
| 1.944645852572096 | 0.415 | 0.442 | 0.478 |
| 1.947787445225686 | 0.419 | 0.447 | 0.485 |
| 1.950929037879276 | 0.423 | 0.453 | 0.492 |
| 1.954070630532866 | 0.427 | 0.458 | 0.499 |
| 1.957212223186455 | 0.432 | 0.464 | 0.506 |
| 1.960353815840045 | 0.436 | 0.469 | 0.513 |
| 1.963495408493635 | 0.441 | 0.475 | 0.521 |
| 1.966637001147225 | 0.445 | 0.48 | 0.529 |
| 1.969778593800815 | 0.45 | 0.486 | 0.536 |
| 1.972920186454405 | 0.454 | 0.492 | 0.544 |
| 1.976061779107994 | 0.459 | 0.498 | 0.553 |
| 1.979203371761584 | 0.463 | 0.504 | 0.561 |
| 1.982344964415174 | 0.468 | 0.51 | 0.57 |
| 1.985486557068764 | 0.473 | 0.516 | 0.579 |
| 1.988628149722354 | 0.477 | 0.522 | 0.588 |
| 1.991769742375943 | 0.482 | 0.528 | 0.597 |
| 1.994911335029533 | 0.487 | 0.534 | 0.607 |
| 1.998052927683123 | 0.491 | 0.541 | 0.616 |
| 2.001194520336712 | 0.496 | 0.547 | 0.627 |
| 2.004336112990302 | 0.501 | 0.554 | 0.637 |
| 2.007477705643892 | 0.506 | 0.561 | 0.648 |
| 2.010619298297482 | 0.511 | 0.568 | 0.659 |
| 2.013760890951071 | 0.516 | 0.574 | 0.671 |
| 2.016902483604661 | 0.521 | 0.582 | 0.683 |
| 2.02004407625825 | 0.526 | 0.589 | 0.696 |
| 2.02318566891184 | 0.531 | 0.596 | 0.709 |
| 2.02632726156543 | 0.536 | 0.603 | 0.722 |
| 2.029468854219019 | 0.541 | 0.611 | 0.736 |
| 2.032610446872609 | 0.546 | 0.619 | 0.751 |
| 2.035752039526198 | 0.551 | 0.627 | 0.767 |
| 2.038893632179788 | 0.557 | 0.635 | 0.783 |
| 2.042035224833378 | 0.562 | 0.643 | 0.801 |
| 2.045176817486967 | 0.567 | 0.651 | 0.819 |
| 2.048318410140557 | 0.573 | 0.659 | 0.839 |
| 2.051460002794146 | 0.578 | 0.668 | 0.86 |
| 2.054601595447736 | 0.584 | 0.677 | 0.882 |
| 2.057743188101325 | 0.589 | 0.686 | 0.907 |
| 2.060884780754915 | 0.595 | 0.695 | 0.933 |
| 2.064026373408505 | 0.601 | 0.705 | 0.962 |
| 2.067167966062094 | 0.606 | 0.714 | 0.994 |
| 2.070309558715684 | 0.612 | 0.724 | 1.03 |
| 2.073451151369273 | 0.618 | 0.735 | 1.071 |
| 2.076592744022863 | 0.624 | 0.745 | 1.118 |
| 2.079734336676452 | 0.63 | 0.756 | 1.175 |
| 2.082875929330042 | 0.636 | 0.767 | 1.245 |
| 2.086017521983632 | 0.642 | 0.778 | 1.338 |
| 2.089159114637221 | 0.648 | 0.79 | 1.474 |
| 2.092300707290811 | 0.654 | 0.802 | 1.739 |
| 2.095442299944401 | 0.661 | 0.815 | 3 |
| 2.09858389259799 | 0.667 | 0.828 | 1.54 |
| 2.10172548525158 | 0.673 | 0.841 | 1.379 |
| 2.104867077905169 | 0.68 | 0.855 | 1.276 |
| 2.108008670558759 | 0.686 | 0.869 | 1.201 |
| 2.111150263212349 | 0.693 | 0.884 | 1.142 |
| 2.114291855865938 | 0.7 | 0.9 | 1.093 |
| 2.117433448519528 | 0.707 | 0.916 | 1.051 |
| 2.120575041173117 | 0.713 | 0.933 | 1.014 |
| 2.123716633826707 | 0.72 | 0.951 | 0.982 |
| 2.126858226480297 | 0.727 | 0.969 | 0.953 |
| 2.129999819133886 | 0.735 | 0.989 | 0.927 |
| 2.133141411787476 | 0.742 | 1.01 | 0.903 |
| 2.136283004441065 | 0.749 | 1.032 | 0.881 |
| 2.139424597094655 | 0.757 | 1.055 | 0.861 |
| 2.142566189748245 | 0.764 | 1.08 | 0.842 |
| 2.145707782401834 | 0.772 | 1.107 | 0.824 |
| 2.148849375055424 | 0.779 | 1.136 | 0.807 |
| 2.151990967709013 | 0.787 | 1.167 | 0.792 |
| 2.155132560362603 | 0.795 | 1.202 | 0.777 |
| 2.158274153016193 | 0.803 | 1.24 | 0.763 |
| 2.161415745669782 | 0.812 | 1.282 | 0.749 |
| 2.164557338323372 | 0.82 | 1.33 | 0.736 |
| 2.167698930976961 | 0.828 | 1.386 | 0.724 |
| 2.170840523630551 | 0.837 | 1.452 | 0.713 |
| 2.173982116284141 | 0.846 | 1.533 | 0.701 |
| 2.17712370893773 | 0.855 | 1.638 | 0.691 |
| 2.18026530159132 | 0.864 | 1.787 | 0.68 |
| 2.183406894244909 | 0.873 | 2.048 | 0.671 |
| 2.186548486898499 | 0.882 | 2.881 | 0.661 |
| 2.189690079552089 | 0.892 | 1.988 | 0.652 |
| 2.192831672205678 | 0.901 | 1.757 | 0.643 |
| 2.195973264859268 | 0.911 | 1.619 | 0.634 |
| 2.199114857512857 | 0.921 | 1.521 | 0.626 |
| 2.202256450166447 | 0.932 | 1.444 | 0.618 |
| 2.205398042820036 | 0.942 | 1.38 | 0.61 |
| 2.208539635473626 | 0.953 | 1.327 | 0.602 |
| 2.211681228127216 | 0.964 | 1.281 | 0.595 |
| 2.214822820780805 | 0.975 | 1.24 | 0.588 |
| 2.217964413434395 | 0.986 | 1.203 | 0.581 |
| 2.221106006087984 | 0.998 | 1.17 | 0.574 |
| 2.224247598741574 | 1.01 | 1.14 | 0.567 |
| 2.227389191395164 | 1.022 | 1.112 | 0.561 |
| 2.230530784048753 | 1.034 | 1.087 | 0.554 |
| 2.233672376702343 | 1.047 | 1.063 | 0.548 |
| 2.236813969355933 | 1.06 | 1.041 | 0.542 |
| 2.239955562009522 | 1.074 | 1.02 | 0.536 |
| 2.243097154663112 | 1.088 | 1 | 0.53 |
| 2.246238747316701 | 1.102 | 0.981 | 0.525 |
| 2.249380339970291 | 1.116 | 0.963 | 0.519 |
| 2.252521932623881 | 1.131 | 0.947 | 0.514 |
| 2.25566352527747 | 1.147 | 0.93 | 0.509 |
| 2.25880511793106 | 1.163 | 0.915 | 0.503 |
| 2.261946710584649 | 1.179 | 0.901 | 0.498 |
| 2.265088303238239 | 1.196 | 0.886 | 0.493 |
| 2.268229895891829 | 1.214 | 0.873 | 0.489 |
| 2.271371488545418 | 1.232 | 0.86 | 0.484 |
| 2.274513081199008 | 1.251 | 0.847 | 0.479 |
| 2.277654673852597 | 1.271 | 0.835 | 0.474 |
| 2.280796266506186 | 1.292 | 0.824 | 0.47 |
| 2.283937859159776 | 1.313 | 0.813 | 0.465 |
| 2.287079451813366 | 1.335 | 0.802 | 0.461 |
| 2.290221044466955 | 1.359 | 0.791 | 0.457 |
| 2.293362637120545 | 1.383 | 0.781 | 0.453 |
| 2.296504229774135 | 1.409 | 0.771 | 0.448 |
| 2.299645822427724 | 1.436 | 0.761 | 0.444 |
| 2.302787415081314 | 1.464 | 0.752 | 0.44 |
| 2.305929007734904 | 1.495 | 0.743 | 0.436 |
| 2.309070600388493 | 1.527 | 0.734 | 0.432 |
| 2.312212193042083 | 1.562 | 0.725 | 0.429 |
| 2.315353785695672 | 1.599 | 0.717 | 0.425 |
| 2.318495378349262 | 1.639 | 0.709 | 0.421 |
| 2.321636971002852 | 1.682 | 0.701 | 0.417 |
| 2.324778563656441 | 1.73 | 0.693 | 0.414 |
| 2.327920156310031 | 1.783 | 0.685 | 0.41 |
| 2.33106174896362 | 1.842 | 0.678 | 0.407 |
| 2.33420334161721 | 1.908 | 0.67 | 0.403 |
| 2.3373449342708 | 1.986 | 0.663 | 0.4 |
| 2.340486526924389 | 2.077 | 0.656 | 0.396 |
| 2.343628119577979 | 2.188 | 0.649 | 0.393 |
| 2.346769712231568 | 2.332 | 0.643 | 0.39 |
| 2.349911304885158 | 2.535 | 0.636 | 0.387 |
| 2.353052897538748 | 2.882 | 0.63 | 0.383 |
| 2.356194490192337 | 16.251 | 0.623 | 0.38 |
| 2.359336082845927 | 2.882 | 0.617 | 0.377 |
| 2.362477675499516 | 2.535 | 0.611 | 0.374 |
| 2.365619268153106 | 2.332 | 0.605 | 0.371 |
| 2.368760860806696 | 2.188 | 0.599 | 0.368 |
| 2.371902453460285 | 2.077 | 0.593 | 0.365 |
| 2.375044046113875 | 1.986 | 0.588 | 0.362 |
| 2.378185638767464 | 1.908 | 0.582 | 0.359 |
| 2.381327231421054 | 1.842 | 0.576 | 0.356 |
| 2.384468824074644 | 1.783 | 0.571 | 0.353 |
| 2.387610416728233 | 1.73 | 0.566 | 0.351 |
| 2.390752009381823 | 1.682 | 0.56 | 0.348 |
| 2.393893602035412 | 1.639 | 0.555 | 0.345 |
| 2.397035194689002 | 1.599 | 0.55 | 0.342 |
| 2.400176787342591 | 1.562 | 0.545 | 0.34 |
| 2.403318379996181 | 1.527 | 0.54 | 0.337 |
| 2.406459972649771 | 1.495 | 0.535 | 0.334 |
| 2.40960156530336 | 1.464 | 0.531 | 0.332 |
| 2.41274315795695 | 1.436 | 0.526 | 0.329 |
| 2.41588475061054 | 1.409 | 0.521 | 0.327 |
| 2.419026343264129 | 1.383 | 0.517 | 0.324 |
| 2.422167935917719 | 1.359 | 0.512 | 0.322 |
| 2.425309528571308 | 1.335 | 0.508 | 0.319 |
| 2.428451121224898 | 1.313 | 0.503 | 0.317 |
| 2.431592713878488 | 1.292 | 0.499 | 0.314 |
| 2.434734306532077 | 1.271 | 0.494 | 0.312 |
| 2.437875899185667 | 1.251 | 0.49 | 0.309 |
| 2.441017491839256 | 1.232 | 0.486 | 0.307 |
| 2.444159084492846 | 1.214 | 0.482 | 0.305 |
| 2.447300677146435 | 1.196 | 0.478 | 0.302 |
| 2.450442269800025 | 1.179 | 0.474 | 0.3 |
| 2.453583862453615 | 1.163 | 0.47 | 0.298 |
| 2.456725455107204 | 1.147 | 0.466 | 0.296 |
| 2.459867047760794 | 1.131 | 0.462 | 0.293 |
| 2.463008640414384 | 1.116 | 0.458 | 0.291 |
| 2.466150233067973 | 1.102 | 0.454 | 0.289 |
| 2.469291825721563 | 1.088 | 0.45 | 0.287 |
| 2.472433418375152 | 1.074 | 0.447 | 0.285 |
| 2.475575011028742 | 1.06 | 0.443 | 0.283 |
| 2.478716603682332 | 1.047 | 0.439 | 0.28 |
| 2.481858196335921 | 1.034 | 0.436 | 0.278 |
| 2.48499978898951 | 1.022 | 0.432 | 0.276 |
| 2.4881413816431 | 1.01 | 0.429 | 0.274 |
| 2.49128297429669 | 0.998 | 0.425 | 0.272 |
| 2.49442456695028 | 0.986 | 0.422 | 0.27 |
| 2.497566159603869 | 0.975 | 0.418 | 0.268 |
| 2.500707752257458 | 0.964 | 0.415 | 0.266 |
| 2.503849344911048 | 0.953 | 0.411 | 0.264 |
| 2.506990937564638 | 0.942 | 0.408 | 0.262 |
| 2.510132530218228 | 0.932 | 0.405 | 0.26 |
| 2.513274122871817 | 0.921 | 0.401 | 0.258 |
| 2.516415715525407 | 0.911 | 0.398 | 0.256 |
| 2.519557308178996 | 0.901 | 0.395 | 0.254 |
| 2.522698900832586 | 0.892 | 0.392 | 0.252 |
| 2.525840493486176 | 0.882 | 0.389 | 0.25 |
| 2.528982086139765 | 0.873 | 0.386 | 0.249 |
| 2.532123678793355 | 0.864 | 0.382 | 0.247 |
| 2.535265271446944 | 0.855 | 0.379 | 0.245 |
| 2.538406864100534 | 0.846 | 0.376 | 0.243 |
| 2.541548456754124 | 0.837 | 0.373 | 0.241 |
| 2.544690049407713 | 0.828 | 0.37 | 0.239 |
| 2.547831642061302 | 0.82 | 0.367 | 0.238 |
| 2.550973234714892 | 0.812 | 0.364 | 0.236 |
| 2.554114827368482 | 0.803 | 0.361 | 0.234 |
| 2.557256420022072 | 0.795 | 0.359 | 0.232 |
| 2.560398012675661 | 0.787 | 0.356 | 0.23 |
| 2.563539605329251 | 0.779 | 0.353 | 0.229 |
| 2.56668119798284 | 0.772 | 0.35 | 0.227 |
| 2.56982279063643 | 0.764 | 0.347 | 0.225 |
| 2.57296438329002 | 0.757 | 0.344 | 0.224 |
| 2.576105975943609 | 0.749 | 0.342 | 0.222 |
| 2.579247568597199 | 0.742 | 0.339 | 0.22 |
| 2.582389161250788 | 0.735 | 0.336 | 0.218 |
| 2.585530753904377 | 0.727 | 0.333 | 0.217 |
| 2.588672346557967 | 0.72 | 0.331 | 0.215 |
| 2.591813939211557 | 0.713 | 0.328 | 0.213 |
| 2.594955531865147 | 0.707 | 0.325 | 0.212 |
| 2.598097124518736 | 0.7 | 0.323 | 0.21 |
| 2.601238717172326 | 0.693 | 0.32 | 0.209 |
| 2.604380309825915 | 0.686 | 0.318 | 0.207 |
| 2.607521902479505 | 0.68 | 0.315 | 0.205 |
| 2.610663495133095 | 0.673 | 0.312 | 0.204 |
| 2.613805087786684 | 0.667 | 0.31 | 0.202 |
| 2.616946680440274 | 0.661 | 0.307 | 0.201 |
| 2.620088273093863 | 0.654 | 0.305 | 0.199 |
| 2.623229865747452 | 0.648 | 0.302 | 0.197 |
| 2.626371458401042 | 0.642 | 0.3 | 0.196 |
| 2.629513051054632 | 0.636 | 0.297 | 0.194 |
| 2.632654643708222 | 0.63 | 0.295 | 0.193 |
| 2.635796236361811 | 0.624 | 0.293 | 0.191 |
| 2.638937829015401 | 0.618 | 0.29 | 0.19 |
| 2.642079421668991 | 0.612 | 0.288 | 0.188 |
| 2.64522101432258 | 0.606 | 0.285 | 0.187 |
| 2.64836260697617 | 0.601 | 0.283 | 0.185 |
| 2.651504199629759 | 0.595 | 0.281 | 0.184 |
| 2.654645792283349 | 0.589 | 0.278 | 0.182 |
| 2.657787384936938 | 0.584 | 0.276 | 0.181 |
| 2.660928977590528 | 0.578 | 0.274 | 0.179 |
| 2.664070570244118 | 0.573 | 0.271 | 0.178 |
| 2.667212162897707 | 0.567 | 0.269 | 0.176 |
| 2.670353755551297 | 0.562 | 0.267 | 0.175 |
| 2.673495348204887 | 0.557 | 0.264 | 0.174 |
| 2.676636940858476 | 0.551 | 0.262 | 0.172 |
| 2.679778533512066 | 0.546 | 0.26 | 0.171 |
| 2.682920126165655 | 0.541 | 0.258 | 0.169 |
| 2.686061718819245 | 0.536 | 0.256 | 0.168 |
| 2.689203311472835 | 0.531 | 0.253 | 0.166 |
| 2.692344904126424 | 0.526 | 0.251 | 0.165 |
| 2.695486496780014 | 0.521 | 0.249 | 0.164 |
| 2.698628089433603 | 0.516 | 0.247 | 0.162 |
| 2.701769682087193 | 0.511 | 0.245 | 0.161 |
| 2.704911274740782 | 0.506 | 0.242 | 0.16 |
| 2.708052867394372 | 0.501 | 0.24 | 0.158 |
| 2.711194460047962 | 0.496 | 0.238 | 0.157 |
| 2.714336052701551 | 0.491 | 0.236 | 0.155 |
| 2.717477645355141 | 0.487 | 0.234 | 0.154 |
| 2.720619238008731 | 0.482 | 0.232 | 0.153 |
| 2.72376083066232 | 0.477 | 0.23 | 0.151 |
| 2.72690242331591 | 0.473 | 0.228 | 0.15 |
| 2.730044015969499 | 0.468 | 0.226 | 0.149 |
| 2.733185608623089 | 0.463 | 0.224 | 0.147 |
| 2.736327201276678 | 0.459 | 0.221 | 0.146 |
| 2.739468793930268 | 0.454 | 0.219 | 0.145 |
| 2.742610386583858 | 0.45 | 0.217 | 0.143 |
| 2.745751979237447 | 0.445 | 0.215 | 0.142 |
| 2.748893571891036 | 0.441 | 0.213 | 0.141 |
| 2.752035164544627 | 0.436 | 0.211 | 0.139 |
| 2.755176757198216 | 0.432 | 0.209 | 0.138 |
| 2.758318349851806 | 0.427 | 0.207 | 0.137 |
| 2.761459942505395 | 0.423 | 0.205 | 0.136 |
| 2.764601535158985 | 0.419 | 0.203 | 0.134 |
| 2.767743127812574 | 0.415 | 0.201 | 0.133 |
| 2.770884720466164 | 0.41 | 0.199 | 0.132 |
| 2.774026313119754 | 0.406 | 0.198 | 0.131 |
| 2.777167905773343 | 0.402 | 0.196 | 0.129 |
| 2.780309498426932 | 0.398 | 0.194 | 0.128 |
| 2.783451091080522 | 0.393 | 0.192 | 0.127 |
| 2.786592683734112 | 0.389 | 0.19 | 0.126 |
| 2.789734276387701 | 0.385 | 0.188 | 0.124 |
| 2.792875869041291 | 0.381 | 0.186 | 0.123 |
| 2.796017461694881 | 0.377 | 0.184 | 0.122 |
| 2.79915905434847 | 0.373 | 0.182 | 0.121 |
| 2.80230064700206 | 0.369 | 0.18 | 0.119 |
| 2.80544223965565 | 0.365 | 0.178 | 0.118 |
| 2.808583832309239 | 0.361 | 0.177 | 0.117 |
| 2.811725424962829 | 0.357 | 0.175 | 0.116 |
| 2.814867017616419 | 0.353 | 0.173 | 0.114 |
| 2.818008610270008 | 0.349 | 0.171 | 0.113 |
| 2.821150202923598 | 0.345 | 0.169 | 0.112 |
| 2.824291795577187 | 0.341 | 0.167 | 0.111 |
| 2.827433388230777 | 0.337 | 0.165 | 0.11 |
| 2.830574980884366 | 0.333 | 0.164 | 0.108 |
| 2.833716573537956 | 0.329 | 0.162 | 0.107 |
| 2.836858166191546 | 0.326 | 0.16 | 0.106 |
| 2.839999758845135 | 0.322 | 0.158 | 0.105 |
| 2.843141351498725 | 0.318 | 0.156 | 0.104 |
| 2.846282944152314 | 0.314 | 0.155 | 0.102 |
| 2.849424536805904 | 0.31 | 0.153 | 0.101 |
| 2.852566129459494 | 0.307 | 0.151 | 0.1 |
| 2.855707722113083 | 0.303 | 0.149 | 0.099 |
| 2.858849314766673 | 0.299 | 0.147 | 0.098 |
| 2.861990907420262 | 0.295 | 0.146 | 0.097 |
| 2.865132500073852 | 0.292 | 0.144 | 0.095 |
| 2.868274092727442 | 0.288 | 0.142 | 0.094 |
| 2.871415685381031 | 0.284 | 0.14 | 0.093 |
| 2.874557278034621 | 0.281 | 0.139 | 0.092 |
| 2.87769887068821 | 0.277 | 0.137 | 0.091 |
| 2.8808404633418 | 0.273 | 0.135 | 0.09 |
| 2.88398205599539 | 0.27 | 0.133 | 0.089 |
| 2.88712364864898 | 0.266 | 0.132 | 0.087 |
| 2.890265241302569 | 0.263 | 0.13 | 0.086 |
| 2.893406833956158 | 0.259 | 0.128 | 0.085 |
| 2.896548426609748 | 0.255 | 0.126 | 0.084 |
| 2.899690019263338 | 0.252 | 0.125 | 0.083 |
| 2.902831611916927 | 0.248 | 0.123 | 0.082 |
| 2.905973204570517 | 0.245 | 0.121 | 0.081 |
| 2.909114797224106 | 0.241 | 0.12 | 0.079 |
| 2.912256389877696 | 0.238 | 0.118 | 0.078 |
| 2.915397982531286 | 0.234 | 0.116 | 0.077 |
| 2.918539575184875 | 0.231 | 0.114 | 0.076 |
| 2.921681167838465 | 0.227 | 0.113 | 0.075 |
| 2.924822760492054 | 0.224 | 0.111 | 0.074 |
| 2.927964353145644 | 0.22 | 0.109 | 0.073 |
| 2.931105945799234 | 0.217 | 0.108 | 0.072 |
| 2.934247538452823 | 0.214 | 0.106 | 0.07 |
| 2.937389131106413 | 0.21 | 0.104 | 0.069 |
| 2.940530723760002 | 0.207 | 0.103 | 0.068 |
| 2.943672316413592 | 0.203 | 0.101 | 0.067 |
| 2.946813909067182 | 0.2 | 0.099 | 0.066 |
| 2.949955501720771 | 0.197 | 0.098 | 0.065 |
| 2.953097094374361 | 0.193 | 0.096 | 0.064 |
| 2.95623868702795 | 0.19 | 0.094 | 0.063 |
| 2.95938027968154 | 0.186 | 0.093 | 0.062 |
| 2.96252187233513 | 0.183 | 0.091 | 0.061 |
| 2.965663464988719 | 0.18 | 0.089 | 0.059 |
| 2.968805057642309 | 0.176 | 0.088 | 0.058 |
| 2.971946650295898 | 0.173 | 0.086 | 0.057 |
| 2.975088242949488 | 0.17 | 0.084 | 0.056 |
| 2.978229835603078 | 0.166 | 0.083 | 0.055 |
| 2.981371428256667 | 0.163 | 0.081 | 0.054 |
| 2.984513020910257 | 0.16 | 0.08 | 0.053 |
| 2.987654613563846 | 0.156 | 0.078 | 0.052 |
| 2.990796206217436 | 0.153 | 0.076 | 0.051 |
| 2.993937798871025 | 0.15 | 0.075 | 0.05 |
| 2.997079391524615 | 0.147 | 0.073 | 0.049 |
| 3.000220984178205 | 0.143 | 0.071 | 0.048 |
| 3.003362576831794 | 0.14 | 0.07 | 0.046 |
| 3.006504169485384 | 0.137 | 0.068 | 0.045 |
| 3.009645762138974 | 0.134 | 0.067 | 0.044 |
| 3.012787354792563 | 0.13 | 0.065 | 0.043 |
| 3.015928947446153 | 0.127 | 0.063 | 0.042 |
| 3.019070540099742 | 0.124 | 0.062 | 0.041 |
| 3.022212132753332 | 0.121 | 0.06 | 0.04 |
| 3.025353725406922 | 0.117 | 0.059 | 0.039 |
| 3.028495318060511 | 0.114 | 0.057 | 0.038 |
| 3.031636910714101 | 0.111 | 0.055 | 0.037 |
| 3.03477850336769 | 0.108 | 0.054 | 0.036 |
| 3.03792009602128 | 0.104 | 0.052 | 0.035 |
| 3.04106168867487 | 0.101 | 0.051 | 0.034 |
| 3.04420328132846 | 0.098 | 0.049 | 0.033 |
| 3.047344873982049 | 0.095 | 0.047 | 0.032 |
| 3.050486466635638 | 0.092 | 0.046 | 0.03 |
| 3.053628059289228 | 0.088 | 0.044 | 0.029 |
| 3.056769651942818 | 0.085 | 0.043 | 0.028 |
| 3.059911244596407 | 0.082 | 0.041 | 0.027 |
| 3.063052837249997 | 0.079 | 0.039 | 0.026 |
| 3.066194429903586 | 0.076 | 0.038 | 0.025 |
| 3.069336022557176 | 0.073 | 0.036 | 0.024 |
| 3.072477615210766 | 0.069 | 0.035 | 0.023 |
| 3.075619207864355 | 0.066 | 0.033 | 0.022 |
| 3.078760800517945 | 0.063 | 0.031 | 0.021 |
| 3.081902393171534 | 0.06 | 0.03 | 0.02 |
| 3.085043985825124 | 0.057 | 0.028 | 0.019 |
| 3.088185578478713 | 0.054 | 0.027 | 0.018 |
| 3.091327171132303 | 0.05 | 0.025 | 0.017 |
| 3.094468763785893 | 0.047 | 0.024 | 0.016 |
| 3.097610356439482 | 0.044 | 0.022 | 0.015 |
| 3.100751949093072 | 0.041 | 0.02 | 0.014 |
| 3.103893541746661 | 0.038 | 0.019 | 0.013 |
| 3.107035134400251 | 0.035 | 0.017 | 0.012 |
| 3.110176727053841 | 0.031 | 0.016 | 0.01 |
| 3.11331831970743 | 0.028 | 0.014 | 0.009 |
| 3.11645991236102 | 0.025 | 0.013 | 0.008 |
| 3.11960150501461 | 0.022 | 0.011 | 0.007 |
| 3.122743097668199 | 0.019 | 0.009 | 0.006 |
| 3.125884690321789 | 0.016 | 0.008 | 0.005 |
| 3.129026282975378 | 0.013 | 0.006 | 0.004 |
| 3.132167875628968 | 0.009 | 0.005 | 0.003 |
| 3.135309468282557 | 0.006 | 0.003 | 0.002 |
| 3.138451060936147 | 0.003 | 0.002 | 0.001 |
| 3.141592653589737 | 0 | 0 | 0 |
| 3.144734246243326 | -0.003 | -0.002 | -0.001 |
| 3.147875838896916 | -0.006 | -0.003 | -0.002 |
| 3.151017431550505 | -0.009 | -0.005 | -0.003 |
| 3.154159024204095 | -0.013 | -0.006 | -0.004 |
| 3.157300616857685 | -0.016 | -0.008 | -0.005 |
| 3.160442209511274 | -0.019 | -0.009 | -0.006 |
| 3.163583802164864 | -0.022 | -0.011 | -0.007 |
| 3.166725394818453 | -0.025 | -0.013 | -0.008 |
| 3.169866987472043 | -0.028 | -0.014 | -0.009 |
| 3.173008580125633 | -0.031 | -0.016 | -0.01 |
| 3.176150172779222 | -0.035 | -0.017 | -0.012 |
| 3.179291765432812 | -0.038 | -0.019 | -0.013 |
| 3.182433358086401 | -0.041 | -0.02 | -0.014 |
| 3.185574950739991 | -0.044 | -0.022 | -0.015 |
| 3.188716543393581 | -0.047 | -0.024 | -0.016 |
| 3.19185813604717 | -0.05 | -0.025 | -0.017 |
| 3.19499972870076 | -0.054 | -0.027 | -0.018 |
| 3.198141321354349 | -0.057 | -0.028 | -0.019 |
| 3.20128291400794 | -0.06 | -0.03 | -0.02 |
| 3.204424506661528 | -0.063 | -0.031 | -0.021 |
| 3.207566099315118 | -0.066 | -0.033 | -0.022 |
| 3.210707691968708 | -0.069 | -0.035 | -0.023 |
| 3.213849284622297 | -0.073 | -0.036 | -0.024 |
| 3.216990877275887 | -0.076 | -0.038 | -0.025 |
| 3.220132469929476 | -0.079 | -0.039 | -0.026 |
| 3.223274062583066 | -0.082 | -0.041 | -0.027 |
| 3.226415655236656 | -0.085 | -0.043 | -0.028 |
| 3.229557247890245 | -0.088 | -0.044 | -0.029 |
| 3.232698840543835 | -0.092 | -0.046 | -0.03 |
| 3.235840433197425 | -0.095 | -0.047 | -0.032 |
| 3.238982025851014 | -0.098 | -0.049 | -0.033 |
| 3.242123618504604 | -0.101 | -0.051 | -0.034 |
| 3.245265211158193 | -0.104 | -0.052 | -0.035 |
| 3.248406803811783 | -0.108 | -0.054 | -0.036 |
| 3.251548396465373 | -0.111 | -0.055 | -0.037 |
| 3.254689989118962 | -0.114 | -0.057 | -0.038 |
| 3.257831581772551 | -0.117 | -0.059 | -0.039 |
| 3.260973174426141 | -0.121 | -0.06 | -0.04 |
| 3.26411476707973 | -0.124 | -0.062 | -0.041 |
| 3.267256359733321 | -0.127 | -0.063 | -0.042 |
| 3.27039795238691 | -0.13 | -0.065 | -0.043 |
| 3.2735395450405 | -0.134 | -0.067 | -0.044 |
| 3.276681137694089 | -0.137 | -0.068 | -0.045 |
| 3.279822730347679 | -0.14 | -0.07 | -0.046 |
| 3.282964323001269 | -0.143 | -0.071 | -0.048 |
| 3.286105915654858 | -0.147 | -0.073 | -0.049 |
| 3.289247508308448 | -0.15 | -0.075 | -0.05 |
| 3.292389100962037 | -0.153 | -0.076 | -0.051 |
| 3.295530693615627 | -0.156 | -0.078 | -0.052 |
| 3.298672286269217 | -0.16 | -0.08 | -0.053 |
| 3.301813878922806 | -0.163 | -0.081 | -0.054 |
| 3.304955471576396 | -0.166 | -0.083 | -0.055 |
| 3.308097064229985 | -0.17 | -0.084 | -0.056 |
| 3.311238656883575 | -0.173 | -0.086 | -0.057 |
| 3.314380249537165 | -0.176 | -0.088 | -0.058 |
| 3.317521842190754 | -0.18 | -0.089 | -0.059 |
| 3.320663434844344 | -0.183 | -0.091 | -0.061 |
| 3.323805027497933 | -0.186 | -0.093 | -0.062 |
| 3.326946620151523 | -0.19 | -0.094 | -0.063 |
| 3.330088212805113 | -0.193 | -0.096 | -0.064 |
| 3.333229805458702 | -0.197 | -0.098 | -0.065 |
| 3.336371398112292 | -0.2 | -0.099 | -0.066 |
| 3.339512990765881 | -0.203 | -0.101 | -0.067 |
| 3.342654583419471 | -0.207 | -0.103 | -0.068 |
| 3.345796176073061 | -0.21 | -0.104 | -0.069 |
| 3.34893776872665 | -0.214 | -0.106 | -0.07 |
| 3.35207936138024 | -0.217 | -0.108 | -0.072 |
| 3.355220954033829 | -0.22 | -0.109 | -0.073 |
| 3.358362546687419 | -0.224 | -0.111 | -0.074 |
| 3.361504139341009 | -0.227 | -0.113 | -0.075 |
| 3.364645731994598 | -0.231 | -0.114 | -0.076 |
| 3.367787324648188 | -0.234 | -0.116 | -0.077 |
| 3.370928917301777 | -0.238 | -0.118 | -0.078 |
| 3.374070509955367 | -0.241 | -0.12 | -0.079 |
| 3.377212102608956 | -0.245 | -0.121 | -0.081 |
| 3.380353695262546 | -0.248 | -0.123 | -0.082 |
| 3.383495287916136 | -0.252 | -0.125 | -0.083 |
| 3.386636880569725 | -0.255 | -0.126 | -0.084 |
| 3.389778473223315 | -0.259 | -0.128 | -0.085 |
| 3.392920065876904 | -0.263 | -0.13 | -0.086 |
| 3.396061658530494 | -0.266 | -0.132 | -0.087 |
| 3.399203251184084 | -0.27 | -0.133 | -0.089 |
| 3.402344843837673 | -0.273 | -0.135 | -0.09 |
| 3.405486436491263 | -0.277 | -0.137 | -0.091 |
| 3.408628029144852 | -0.281 | -0.139 | -0.092 |
| 3.411769621798442 | -0.284 | -0.14 | -0.093 |
| 3.414911214452032 | -0.288 | -0.142 | -0.094 |
| 3.418052807105621 | -0.292 | -0.144 | -0.095 |
| 3.421194399759211 | -0.295 | -0.146 | -0.097 |
| 3.4243359924128 | -0.299 | -0.147 | -0.098 |
| 3.42747758506639 | -0.303 | -0.149 | -0.099 |
| 3.43061917771998 | -0.307 | -0.151 | -0.1 |
| 3.433760770373569 | -0.31 | -0.153 | -0.101 |
| 3.436902363027159 | -0.314 | -0.155 | -0.102 |
| 3.440043955680748 | -0.318 | -0.156 | -0.104 |
| 3.443185548334338 | -0.322 | -0.158 | -0.105 |
| 3.446327140987927 | -0.326 | -0.16 | -0.106 |
| 3.449468733641517 | -0.329 | -0.162 | -0.107 |
| 3.452610326295107 | -0.333 | -0.164 | -0.108 |
| 3.455751918948696 | -0.337 | -0.165 | -0.11 |
| 3.458893511602286 | -0.341 | -0.167 | -0.111 |
| 3.462035104255876 | -0.345 | -0.169 | -0.112 |
| 3.465176696909465 | -0.349 | -0.171 | -0.113 |
| 3.468318289563055 | -0.353 | -0.173 | -0.114 |
| 3.471459882216644 | -0.357 | -0.175 | -0.116 |
| 3.474601474870234 | -0.361 | -0.177 | -0.117 |
| 3.477743067523824 | -0.365 | -0.178 | -0.118 |
| 3.480884660177413 | -0.369 | -0.18 | -0.119 |
| 3.484026252831002 | -0.373 | -0.182 | -0.121 |
| 3.487167845484592 | -0.377 | -0.184 | -0.122 |
| 3.490309438138182 | -0.381 | -0.186 | -0.123 |
| 3.493451030791772 | -0.385 | -0.188 | -0.124 |
| 3.496592623445361 | -0.389 | -0.19 | -0.126 |
| 3.499734216098951 | -0.393 | -0.192 | -0.127 |
| 3.50287580875254 | -0.398 | -0.194 | -0.128 |
| 3.50601740140613 | -0.402 | -0.196 | -0.129 |
| 3.50915899405972 | -0.406 | -0.198 | -0.131 |
| 3.512300586713309 | -0.41 | -0.199 | -0.132 |
| 3.515442179366899 | -0.415 | -0.201 | -0.133 |
| 3.518583772020488 | -0.419 | -0.203 | -0.134 |
| 3.521725364674078 | -0.423 | -0.205 | -0.136 |
| 3.524866957327668 | -0.427 | -0.207 | -0.137 |
| 3.528008549981257 | -0.432 | -0.209 | -0.138 |
| 3.531150142634847 | -0.436 | -0.211 | -0.139 |
| 3.534291735288436 | -0.441 | -0.213 | -0.141 |
| 3.537433327942026 | -0.445 | -0.215 | -0.142 |
| 3.540574920595616 | -0.45 | -0.217 | -0.143 |
| 3.543716513249205 | -0.454 | -0.219 | -0.145 |
| 3.546858105902795 | -0.459 | -0.221 | -0.146 |
| 3.549999698556384 | -0.463 | -0.224 | -0.147 |
| 3.553141291209974 | -0.468 | -0.226 | -0.149 |
| 3.556282883863564 | -0.473 | -0.228 | -0.15 |
| 3.559424476517153 | -0.477 | -0.23 | -0.151 |
| 3.562566069170743 | -0.482 | -0.232 | -0.153 |
| 3.565707661824332 | -0.487 | -0.234 | -0.154 |
| 3.568849254477922 | -0.491 | -0.236 | -0.155 |
| 3.571990847131511 | -0.496 | -0.238 | -0.157 |
| 3.575132439785101 | -0.501 | -0.24 | -0.158 |
| 3.578274032438691 | -0.506 | -0.242 | -0.16 |
| 3.58141562509228 | -0.511 | -0.245 | -0.161 |
| 3.58455721774587 | -0.516 | -0.247 | -0.162 |
| 3.58769881039946 | -0.521 | -0.249 | -0.164 |
| 3.590840403053049 | -0.526 | -0.251 | -0.165 |
| 3.593981995706639 | -0.531 | -0.253 | -0.166 |
| 3.597123588360228 | -0.536 | -0.256 | -0.168 |
| 3.600265181013818 | -0.541 | -0.258 | -0.169 |
| 3.603406773667407 | -0.546 | -0.26 | -0.171 |
| 3.606548366320997 | -0.551 | -0.262 | -0.172 |
| 3.609689958974587 | -0.557 | -0.264 | -0.174 |
| 3.612831551628176 | -0.562 | -0.267 | -0.175 |
| 3.615973144281766 | -0.567 | -0.269 | -0.176 |
| 3.619114736935355 | -0.573 | -0.271 | -0.178 |
| 3.622256329588945 | -0.578 | -0.274 | -0.179 |
| 3.625397922242534 | -0.584 | -0.276 | -0.181 |
| 3.628539514896124 | -0.589 | -0.278 | -0.182 |
| 3.631681107549714 | -0.595 | -0.281 | -0.184 |
| 3.634822700203303 | -0.601 | -0.283 | -0.185 |
| 3.637964292856893 | -0.606 | -0.285 | -0.187 |
| 3.641105885510483 | -0.612 | -0.288 | -0.188 |
| 3.644247478164072 | -0.618 | -0.29 | -0.19 |
| 3.647389070817662 | -0.624 | -0.293 | -0.191 |
| 3.650530663471251 | -0.63 | -0.295 | -0.193 |
| 3.653672256124841 | -0.636 | -0.297 | -0.194 |
| 3.656813848778431 | -0.642 | -0.3 | -0.196 |
| 3.65995544143202 | -0.648 | -0.302 | -0.197 |
| 3.66309703408561 | -0.654 | -0.305 | -0.199 |
| 3.666238626739199 | -0.661 | -0.307 | -0.201 |
| 3.66938021939279 | -0.667 | -0.31 | -0.202 |
| 3.672521812046378 | -0.673 | -0.312 | -0.204 |
| 3.675663404699968 | -0.68 | -0.315 | -0.205 |
| 3.678804997353558 | -0.686 | -0.318 | -0.207 |
| 3.681946590007147 | -0.693 | -0.32 | -0.209 |
| 3.685088182660737 | -0.7 | -0.323 | -0.21 |
| 3.688229775314326 | -0.707 | -0.325 | -0.212 |
| 3.691371367967916 | -0.713 | -0.328 | -0.213 |
| 3.694512960621506 | -0.72 | -0.331 | -0.215 |
| 3.697654553275095 | -0.727 | -0.333 | -0.217 |
| 3.700796145928685 | -0.735 | -0.336 | -0.218 |
| 3.703937738582274 | -0.742 | -0.339 | -0.22 |
| 3.707079331235864 | -0.749 | -0.342 | -0.222 |
| 3.710220923889454 | -0.757 | -0.344 | -0.224 |
| 3.713362516543043 | -0.764 | -0.347 | -0.225 |
| 3.716504109196633 | -0.772 | -0.35 | -0.227 |
| 3.719645701850223 | -0.779 | -0.353 | -0.229 |
| 3.722787294503812 | -0.787 | -0.356 | -0.23 |
| 3.725928887157402 | -0.795 | -0.359 | -0.232 |
| 3.729070479810991 | -0.803 | -0.361 | -0.234 |
| 3.732212072464581 | -0.812 | -0.364 | -0.236 |
| 3.735353665118171 | -0.82 | -0.367 | -0.238 |
| 3.73849525777176 | -0.828 | -0.37 | -0.239 |
| 3.74163685042535 | -0.837 | -0.373 | -0.241 |
| 3.744778443078939 | -0.846 | -0.376 | -0.243 |
| 3.747920035732529 | -0.855 | -0.379 | -0.245 |
| 3.751061628386119 | -0.864 | -0.382 | -0.247 |
| 3.754203221039708 | -0.873 | -0.386 | -0.249 |
| 3.757344813693298 | -0.882 | -0.389 | -0.25 |
| 3.760486406346887 | -0.892 | -0.392 | -0.252 |
| 3.763627999000477 | -0.901 | -0.395 | -0.254 |
| 3.766769591654067 | -0.911 | -0.398 | -0.256 |
| 3.769911184307656 | -0.921 | -0.401 | -0.258 |
| 3.773052776961246 | -0.932 | -0.405 | -0.26 |
| 3.776194369614835 | -0.942 | -0.408 | -0.262 |
| 3.779335962268425 | -0.953 | -0.411 | -0.264 |
| 3.782477554922014 | -0.964 | -0.415 | -0.266 |
| 3.785619147575604 | -0.975 | -0.418 | -0.268 |
| 3.788760740229193 | -0.986 | -0.422 | -0.27 |
| 3.791902332882783 | -0.998 | -0.425 | -0.272 |
| 3.795043925536373 | -1.01 | -0.429 | -0.274 |
| 3.798185518189962 | -1.022 | -0.432 | -0.276 |
| 3.801327110843552 | -1.034 | -0.436 | -0.278 |
| 3.804468703497142 | -1.047 | -0.439 | -0.28 |
| 3.807610296150731 | -1.06 | -0.443 | -0.283 |
| 3.810751888804321 | -1.074 | -0.447 | -0.285 |
| 3.813893481457911 | -1.088 | -0.45 | -0.287 |
| 3.8170350741115 | -1.102 | -0.454 | -0.289 |
| 3.82017666676509 | -1.116 | -0.458 | -0.291 |
| 3.823318259418679 | -1.131 | -0.462 | -0.293 |
| 3.826459852072269 | -1.147 | -0.466 | -0.296 |
| 3.829601444725859 | -1.163 | -0.47 | -0.298 |
| 3.832743037379448 | -1.179 | -0.474 | -0.3 |
| 3.835884630033038 | -1.196 | -0.478 | -0.302 |
| 3.839026222686627 | -1.214 | -0.482 | -0.305 |
| 3.842167815340217 | -1.232 | -0.486 | -0.307 |
| 3.845309407993807 | -1.251 | -0.49 | -0.309 |
| 3.848451000647396 | -1.271 | -0.494 | -0.312 |
| 3.851592593300986 | -1.292 | -0.499 | -0.314 |
| 3.854734185954575 | -1.313 | -0.503 | -0.317 |
| 3.857875778608165 | -1.335 | -0.508 | -0.319 |
| 3.861017371261755 | -1.359 | -0.512 | -0.322 |
| 3.864158963915344 | -1.383 | -0.517 | -0.324 |
| 3.867300556568933 | -1.409 | -0.521 | -0.327 |
| 3.870442149222523 | -1.436 | -0.526 | -0.329 |
| 3.873583741876112 | -1.464 | -0.531 | -0.332 |
| 3.876725334529703 | -1.495 | -0.535 | -0.334 |
| 3.879866927183292 | -1.527 | -0.54 | -0.337 |
| 3.883008519836882 | -1.562 | -0.545 | -0.34 |
| 3.886150112490471 | -1.599 | -0.55 | -0.342 |
| 3.889291705144061 | -1.639 | -0.555 | -0.345 |
| 3.892433297797651 | -1.682 | -0.56 | -0.348 |
| 3.89557489045124 | -1.73 | -0.566 | -0.351 |
| 3.89871648310483 | -1.783 | -0.571 | -0.353 |
| 3.901858075758419 | -1.842 | -0.576 | -0.356 |
| 3.904999668412009 | -1.908 | -0.582 | -0.359 |
| 3.908141261065598 | -1.986 | -0.588 | -0.362 |
| 3.911282853719188 | -2.077 | -0.593 | -0.365 |
| 3.914424446372778 | -2.188 | -0.599 | -0.368 |
| 3.917566039026367 | -2.332 | -0.605 | -0.371 |
| 3.920707631679957 | -2.535 | -0.611 | -0.374 |
| 3.923849224333547 | -2.882 | -0.617 | -0.377 |
| 3.926990816987136 | -14.94 | -0.623 | -0.38 |
| 3.930132409640726 | -2.882 | -0.63 | -0.383 |
| 3.933274002294315 | -2.535 | -0.636 | -0.387 |
| 3.936415594947905 | -2.332 | -0.643 | -0.39 |
| 3.939557187601495 | -2.188 | -0.649 | -0.393 |
| 3.942698780255084 | -2.077 | -0.656 | -0.396 |
| 3.945840372908674 | -1.986 | -0.663 | -0.4 |
| 3.948981965562263 | -1.908 | -0.67 | -0.403 |
| 3.952123558215853 | -1.842 | -0.678 | -0.407 |
| 3.955265150869442 | -1.783 | -0.685 | -0.41 |
| 3.958406743523032 | -1.73 | -0.693 | -0.414 |
| 3.961548336176622 | -1.682 | -0.701 | -0.417 |
| 3.964689928830211 | -1.639 | -0.709 | -0.421 |
| 3.967831521483801 | -1.599 | -0.717 | -0.425 |
| 3.97097311413739 | -1.562 | -0.725 | -0.429 |
| 3.97411470679098 | -1.527 | -0.734 | -0.432 |
| 3.97725629944457 | -1.495 | -0.743 | -0.436 |
| 3.98039789209816 | -1.464 | -0.752 | -0.44 |
| 3.983539484751749 | -1.436 | -0.761 | -0.444 |
| 3.986681077405338 | -1.409 | -0.771 | -0.448 |
| 3.989822670058928 | -1.383 | -0.781 | -0.453 |
| 3.992964262712517 | -1.359 | -0.791 | -0.457 |
| 3.996105855366107 | -1.335 | -0.802 | -0.461 |
| 3.999247448019697 | -1.313 | -0.813 | -0.465 |
| 4.002389040673287 | -1.292 | -0.824 | -0.47 |
| 4.005530633326877 | -1.271 | -0.835 | -0.474 |
| 4.008672225980466 | -1.251 | -0.847 | -0.479 |
| 4.011813818634056 | -1.232 | -0.86 | -0.484 |
| 4.014955411287645 | -1.214 | -0.873 | -0.489 |
| 4.018097003941234 | -1.196 | -0.886 | -0.493 |
| 4.021238596594824 | -1.179 | -0.901 | -0.498 |
| 4.024380189248414 | -1.163 | -0.915 | -0.503 |
| 4.027521781902004 | -1.147 | -0.93 | -0.509 |
| 4.030663374555593 | -1.131 | -0.947 | -0.514 |
| 4.033804967209183 | -1.116 | -0.963 | -0.519 |
| 4.036946559862773 | -1.102 | -0.981 | -0.525 |
| 4.040088152516362 | -1.088 | -1 | -0.53 |
| 4.043229745169951 | -1.074 | -1.02 | -0.536 |
| 4.046371337823541 | -1.06 | -1.041 | -0.542 |
| 4.049512930477131 | -1.047 | -1.063 | -0.548 |
| 4.05265452313072 | -1.034 | -1.087 | -0.554 |
| 4.05579611578431 | -1.022 | -1.112 | -0.561 |
| 4.0589377084379 | -1.01 | -1.14 | -0.567 |
| 4.062079301091489 | -0.998 | -1.17 | -0.574 |
| 4.065220893745079 | -0.986 | -1.203 | -0.581 |
| 4.068362486398668 | -0.975 | -1.24 | -0.588 |
| 4.071504079052258 | -0.964 | -1.281 | -0.595 |
| 4.074645671705848 | -0.953 | -1.327 | -0.602 |
| 4.077787264359437 | -0.942 | -1.38 | -0.61 |
| 4.080928857013027 | -0.932 | -1.444 | -0.618 |
| 4.084070449666616 | -0.921 | -1.521 | -0.626 |
| 4.087212042320206 | -0.911 | -1.619 | -0.634 |
| 4.090353634973795 | -0.901 | -1.757 | -0.643 |
| 4.093495227627385 | -0.892 | -1.988 | -0.652 |
| 4.096636820280975 | -0.882 | -2.881 | -0.661 |
| 4.099778412934564 | -0.873 | -2.048 | -0.671 |
| 4.102920005588154 | -0.864 | -1.787 | -0.68 |
| 4.106061598241744 | -0.855 | -1.638 | -0.691 |
| 4.109203190895333 | -0.846 | -1.533 | -0.701 |
| 4.112344783548923 | -0.837 | -1.452 | -0.713 |
| 4.115486376202512 | -0.828 | -1.386 | -0.724 |
| 4.118627968856102 | -0.82 | -1.33 | -0.736 |
| 4.121769561509692 | -0.812 | -1.282 | -0.749 |
| 4.124911154163281 | -0.803 | -1.24 | -0.763 |
| 4.128052746816871 | -0.795 | -1.202 | -0.777 |
| 4.13119433947046 | -0.787 | -1.167 | -0.792 |
| 4.13433593212405 | -0.779 | -1.136 | -0.807 |
| 4.13747752477764 | -0.772 | -1.107 | -0.824 |
| 4.14061911743123 | -0.764 | -1.08 | -0.842 |
| 4.143760710084818 | -0.757 | -1.055 | -0.861 |
| 4.146902302738408 | -0.749 | -1.032 | -0.881 |
| 4.150043895391998 | -0.742 | -1.01 | -0.903 |
| 4.153185488045588 | -0.735 | -0.989 | -0.927 |
| 4.156327080699177 | -0.727 | -0.969 | -0.953 |
| 4.159468673352766 | -0.72 | -0.951 | -0.982 |
| 4.162610266006356 | -0.713 | -0.933 | -1.014 |
| 4.165751858659946 | -0.707 | -0.916 | -1.051 |
| 4.168893451313535 | -0.7 | -0.9 | -1.093 |
| 4.172035043967125 | -0.693 | -0.884 | -1.142 |
| 4.175176636620715 | -0.686 | -0.869 | -1.201 |
| 4.178318229274304 | -0.68 | -0.855 | -1.276 |
| 4.181459821927894 | -0.673 | -0.841 | -1.379 |
| 4.184601414581484 | -0.667 | -0.828 | -1.54 |
| 4.187743007235073 | -0.661 | -0.815 | -3 |
| 4.190884599888663 | -0.654 | -0.802 | -1.739 |
| 4.194026192542252 | -0.648 | -0.79 | -1.474 |
| 4.197167785195842 | -0.642 | -0.778 | -1.338 |
| 4.200309377849432 | -0.636 | -0.767 | -1.245 |
| 4.203450970503021 | -0.63 | -0.756 | -1.175 |
| 4.206592563156611 | -0.624 | -0.745 | -1.118 |
| 4.2097341558102 | -0.618 | -0.735 | -1.071 |
| 4.21287574846379 | -0.612 | -0.724 | -1.03 |
| 4.21601734111738 | -0.606 | -0.714 | -0.994 |
| 4.21915893377097 | -0.601 | -0.705 | -0.962 |
| 4.222300526424559 | -0.595 | -0.695 | -0.933 |
| 4.225442119078148 | -0.589 | -0.686 | -0.907 |
| 4.228583711731738 | -0.584 | -0.677 | -0.882 |
| 4.231725304385327 | -0.578 | -0.668 | -0.86 |
| 4.234866897038917 | -0.573 | -0.659 | -0.839 |
| 4.238008489692506 | -0.567 | -0.651 | -0.819 |
| 4.241150082346096 | -0.562 | -0.643 | -0.801 |
| 4.244291674999685 | -0.557 | -0.635 | -0.783 |
| 4.247433267653276 | -0.551 | -0.627 | -0.767 |
| 4.250574860306865 | -0.546 | -0.619 | -0.751 |
| 4.253716452960455 | -0.541 | -0.611 | -0.736 |
| 4.256858045614044 | -0.536 | -0.603 | -0.722 |
| 4.259999638267634 | -0.531 | -0.596 | -0.709 |
| 4.263141230921224 | -0.526 | -0.589 | -0.696 |
| 4.266282823574813 | -0.521 | -0.582 | -0.683 |
| 4.269424416228403 | -0.516 | -0.574 | -0.671 |
| 4.272566008881992 | -0.511 | -0.568 | -0.659 |
| 4.275707601535582 | -0.506 | -0.561 | -0.648 |
| 4.27884919418917 | -0.501 | -0.554 | -0.637 |
| 4.28199078684276 | -0.496 | -0.547 | -0.627 |
| 4.285132379496351 | -0.491 | -0.541 | -0.616 |
| 4.28827397214994 | -0.487 | -0.534 | -0.607 |
| 4.29141556480353 | -0.482 | -0.528 | -0.597 |
| 4.294557157457119 | -0.477 | -0.522 | -0.588 |
| 4.29769875011071 | -0.473 | -0.516 | -0.579 |
| 4.300840342764299 | -0.468 | -0.51 | -0.57 |
| 4.303981935417888 | -0.463 | -0.504 | -0.561 |
| 4.307123528071478 | -0.459 | -0.498 | -0.553 |
| 4.310265120725067 | -0.454 | -0.492 | -0.544 |
| 4.313406713378657 | -0.45 | -0.486 | -0.536 |
| 4.316548306032247 | -0.445 | -0.48 | -0.529 |
| 4.319689898685836 | -0.441 | -0.475 | -0.521 |
| 4.322831491339426 | -0.436 | -0.469 | -0.513 |
| 4.325973083993015 | -0.432 | -0.464 | -0.506 |
| 4.329114676646605 | -0.427 | -0.458 | -0.499 |
| 4.332256269300195 | -0.423 | -0.453 | -0.492 |
| 4.335397861953784 | -0.419 | -0.447 | -0.485 |
| 4.338539454607374 | -0.415 | -0.442 | -0.478 |
| 4.341681047260963 | -0.41 | -0.437 | -0.471 |
| 4.344822639914553 | -0.406 | -0.432 | -0.465 |
| 4.347964232568143 | -0.402 | -0.427 | -0.458 |
| 4.351105825221732 | -0.398 | -0.422 | -0.452 |
| 4.354247417875322 | -0.393 | -0.417 | -0.446 |
| 4.357389010528911 | -0.389 | -0.412 | -0.44 |
| 4.360530603182501 | -0.385 | -0.407 | -0.434 |
| 4.36367219583609 | -0.381 | -0.402 | -0.428 |
| 4.36681378848968 | -0.377 | -0.397 | -0.422 |
| 4.36995538114327 | -0.373 | -0.392 | -0.416 |
| 4.373096973796859 | -0.369 | -0.388 | -0.411 |
| 4.376238566450449 | -0.365 | -0.383 | -0.405 |
| 4.379380159104038 | -0.361 | -0.378 | -0.399 |
| 4.382521751757628 | -0.357 | -0.374 | -0.394 |
| 4.385663344411217 | -0.353 | -0.369 | -0.389 |
| 4.388804937064807 | -0.349 | -0.365 | -0.383 |
| 4.391946529718397 | -0.345 | -0.36 | -0.378 |
| 4.395088122371987 | -0.341 | -0.356 | -0.373 |
| 4.398229715025576 | -0.337 | -0.351 | -0.368 |
| 4.401371307679165 | -0.333 | -0.347 | -0.363 |
| 4.404512900332755 | -0.329 | -0.342 | -0.358 |
| 4.407654492986345 | -0.326 | -0.338 | -0.353 |
| 4.410796085639934 | -0.322 | -0.334 | -0.348 |
| 4.413937678293524 | -0.318 | -0.33 | -0.343 |
| 4.417079270947114 | -0.314 | -0.325 | -0.338 |
| 4.420220863600703 | -0.31 | -0.321 | -0.334 |
| 4.423362456254293 | -0.307 | -0.317 | -0.329 |
| 4.426504048907883 | -0.303 | -0.313 | -0.324 |
| 4.429645641561472 | -0.299 | -0.309 | -0.32 |
| 4.432787234215062 | -0.295 | -0.305 | -0.315 |
| 4.435928826868651 | -0.292 | -0.301 | -0.311 |
| 4.43907041952224 | -0.288 | -0.297 | -0.306 |
| 4.44221201217583 | -0.284 | -0.293 | -0.302 |
| 4.44535360482942 | -0.281 | -0.289 | -0.297 |
| 4.44849519748301 | -0.277 | -0.285 | -0.293 |
| 4.4516367901366 | -0.273 | -0.281 | -0.289 |
| 4.454778382790188 | -0.27 | -0.277 | -0.284 |
| 4.457919975443779 | -0.266 | -0.273 | -0.28 |
| 4.461061568097368 | -0.263 | -0.269 | -0.276 |
| 4.464203160750958 | -0.259 | -0.265 | -0.272 |
| 4.467344753404547 | -0.255 | -0.261 | -0.268 |
| 4.470486346058137 | -0.252 | -0.258 | -0.264 |
| 4.473627938711726 | -0.248 | -0.254 | -0.26 |
| 4.476769531365316 | -0.245 | -0.25 | -0.256 |
| 4.479911124018905 | -0.241 | -0.246 | -0.252 |
| 4.483052716672495 | -0.238 | -0.243 | -0.248 |
| 4.486194309326085 | -0.234 | -0.239 | -0.244 |
| 4.489335901979674 | -0.231 | -0.235 | -0.24 |
| 4.492477494633264 | -0.227 | -0.231 | -0.236 |
| 4.495619087286854 | -0.224 | -0.228 | -0.232 |
| 4.498760679940443 | -0.22 | -0.224 | -0.228 |
| 4.501902272594033 | -0.217 | -0.221 | -0.224 |
| 4.505043865247622 | -0.214 | -0.217 | -0.22 |
| 4.508185457901212 | -0.21 | -0.213 | -0.217 |
| 4.511327050554801 | -0.207 | -0.21 | -0.213 |
| 4.514468643208391 | -0.203 | -0.206 | -0.209 |
| 4.517610235861981 | -0.2 | -0.203 | -0.206 |
| 4.520751828515571 | -0.197 | -0.199 | -0.202 |
| 4.52389342116916 | -0.193 | -0.196 | -0.198 |
| 4.52703501382275 | -0.19 | -0.192 | -0.195 |
| 4.530176606476339 | -0.186 | -0.189 | -0.191 |
| 4.533318199129928 | -0.183 | -0.185 | -0.187 |
| 4.536459791783518 | -0.18 | -0.182 | -0.184 |
| 4.539601384437108 | -0.176 | -0.178 | -0.18 |
| 4.542742977090698 | -0.173 | -0.175 | -0.177 |
| 4.545884569744287 | -0.17 | -0.171 | -0.173 |
| 4.549026162397876 | -0.166 | -0.168 | -0.17 |
| 4.552167755051466 | -0.163 | -0.165 | -0.166 |
| 4.555309347705056 | -0.16 | -0.161 | -0.163 |
| 4.558450940358646 | -0.156 | -0.158 | -0.159 |
| 4.561592533012235 | -0.153 | -0.154 | -0.156 |
| 4.564734125665825 | -0.15 | -0.151 | -0.152 |
| 4.567875718319415 | -0.147 | -0.148 | -0.149 |
| 4.571017310973004 | -0.143 | -0.144 | -0.145 |
| 4.574158903626594 | -0.14 | -0.141 | -0.142 |
| 4.577300496280183 | -0.137 | -0.138 | -0.139 |
| 4.580442088933772 | -0.134 | -0.134 | -0.135 |
| 4.583583681587362 | -0.13 | -0.131 | -0.132 |
| 4.586725274240952 | -0.127 | -0.128 | -0.128 |
| 4.589866866894542 | -0.124 | -0.124 | -0.125 |
| 4.593008459548131 | -0.121 | -0.121 | -0.122 |
| 4.596150052201721 | -0.117 | -0.118 | -0.118 |
| 4.59929164485531 | -0.114 | -0.115 | -0.115 |
| 4.6024332375089 | -0.111 | -0.111 | -0.112 |
| 4.60557483016249 | -0.108 | -0.108 | -0.108 |
| 4.608716422816079 | -0.104 | -0.105 | -0.105 |
| 4.611858015469668 | -0.101 | -0.102 | -0.102 |
| 4.614999608123258 | -0.098 | -0.098 | -0.099 |
| 4.618141200776848 | -0.095 | -0.095 | -0.095 |
| 4.621282793430437 | -0.092 | -0.092 | -0.092 |
| 4.624424386084027 | -0.088 | -0.089 | -0.089 |
| 4.627565978737617 | -0.085 | -0.085 | -0.086 |
| 4.630707571391206 | -0.082 | -0.082 | -0.082 |
| 4.633849164044795 | -0.079 | -0.079 | -0.079 |
| 4.636990756698386 | -0.076 | -0.076 | -0.076 |
| 4.640132349351975 | -0.073 | -0.073 | -0.073 |
| 4.643273942005564 | -0.069 | -0.069 | -0.07 |
| 4.646415534659154 | -0.066 | -0.066 | -0.066 |
| 4.649557127312744 | -0.063 | -0.063 | -0.063 |
| 4.652698719966334 | -0.06 | -0.06 | -0.06 |
| 4.655840312619923 | -0.057 | -0.057 | -0.057 |
| 4.658981905273513 | -0.054 | -0.054 | -0.054 |
| 4.662123497927102 | -0.05 | -0.05 | -0.05 |
| 4.665265090580692 | -0.047 | -0.047 | -0.047 |
| 4.668406683234282 | -0.044 | -0.044 | -0.044 |
| 4.671548275887871 | -0.041 | -0.041 | -0.041 |
| 4.674689868541461 | -0.038 | -0.038 | -0.038 |
| 4.67783146119505 | -0.035 | -0.035 | -0.035 |
| 4.68097305384864 | -0.031 | -0.031 | -0.031 |
| 4.68411464650223 | -0.028 | -0.028 | -0.028 |
| 4.687256239155819 | -0.025 | -0.025 | -0.025 |
| 4.690397831809409 | -0.022 | -0.022 | -0.022 |
| 4.693539424462998 | -0.019 | -0.019 | -0.019 |
| 4.696681017116588 | -0.016 | -0.016 | -0.016 |
| 4.699822609770177 | -0.013 | -0.013 | -0.013 |
| 4.702964202423767 | -0.009 | -0.009 | -0.009 |
| 4.706105795077356 | -0.006 | -0.006 | -0.006 |
| 4.709247387730946 | -0.003 | -0.003 | -0.003 |
| 4.712388980384535 | 0 | 0 | 0 |
| 4.715530573038126 | 0.003 | 0.003 | 0.003 |
| 4.718672165691715 | 0.006 | 0.006 | 0.006 |
| 4.721813758345305 | 0.009 | 0.009 | 0.009 |
| 4.724955350998894 | 0.013 | 0.013 | 0.013 |
| 4.728096943652484 | 0.016 | 0.016 | 0.016 |
| 4.731238536306074 | 0.019 | 0.019 | 0.019 |
| 4.734380128959663 | 0.022 | 0.022 | 0.022 |
| 4.737521721613253 | 0.025 | 0.025 | 0.025 |
| 4.740663314266842 | 0.028 | 0.028 | 0.028 |
| 4.743804906920432 | 0.031 | 0.031 | 0.031 |
| 4.74694649957402 | 0.035 | 0.035 | 0.035 |
| 4.750088092227611 | 0.038 | 0.038 | 0.038 |
| 4.7532296848812 | 0.041 | 0.041 | 0.041 |
| 4.75637127753479 | 0.044 | 0.044 | 0.044 |
| 4.75951287018838 | 0.047 | 0.047 | 0.047 |
| 4.76265446284197 | 0.05 | 0.05 | 0.05 |
| 4.765796055495559 | 0.054 | 0.054 | 0.054 |
| 4.768937648149149 | 0.057 | 0.057 | 0.057 |
| 4.772079240802738 | 0.06 | 0.06 | 0.06 |
| 4.775220833456327 | 0.063 | 0.063 | 0.063 |
| 4.778362426109917 | 0.066 | 0.066 | 0.066 |
| 4.781504018763507 | 0.069 | 0.069 | 0.07 |
| 4.784645611417097 | 0.073 | 0.073 | 0.073 |
| 4.787787204070686 | 0.076 | 0.076 | 0.076 |
| 4.790928796724275 | 0.079 | 0.079 | 0.079 |
| 4.794070389377865 | 0.082 | 0.082 | 0.082 |
| 4.797211982031455 | 0.085 | 0.085 | 0.086 |
| 4.800353574685045 | 0.088 | 0.089 | 0.089 |
| 4.803495167338634 | 0.092 | 0.092 | 0.092 |
| 4.806636759992224 | 0.095 | 0.095 | 0.095 |
| 4.809778352645814 | 0.098 | 0.098 | 0.099 |
| 4.812919945299403 | 0.101 | 0.102 | 0.102 |
| 4.816061537952993 | 0.104 | 0.105 | 0.105 |
| 4.819203130606582 | 0.108 | 0.108 | 0.108 |
| 4.822344723260172 | 0.111 | 0.111 | 0.112 |
| 4.825486315913761 | 0.114 | 0.115 | 0.115 |
| 4.828627908567351 | 0.117 | 0.118 | 0.118 |
| 4.83176950122094 | 0.121 | 0.121 | 0.122 |
| 4.83491109387453 | 0.124 | 0.124 | 0.125 |
| 4.83805268652812 | 0.127 | 0.128 | 0.128 |
| 4.841194279181709 | 0.13 | 0.131 | 0.132 |
| 4.844335871835299 | 0.134 | 0.134 | 0.135 |
| 4.847477464488889 | 0.137 | 0.138 | 0.139 |
| 4.850619057142478 | 0.14 | 0.141 | 0.142 |
| 4.853760649796068 | 0.143 | 0.144 | 0.145 |
| 4.856902242449657 | 0.147 | 0.148 | 0.149 |
| 4.860043835103247 | 0.15 | 0.151 | 0.152 |
| 4.863185427756837 | 0.153 | 0.154 | 0.156 |
| 4.866327020410426 | 0.156 | 0.158 | 0.159 |
| 4.869468613064015 | 0.16 | 0.161 | 0.163 |
| 4.872610205717605 | 0.163 | 0.165 | 0.166 |
| 4.875751798371195 | 0.166 | 0.168 | 0.17 |
| 4.878893391024784 | 0.17 | 0.171 | 0.173 |
| 4.882034983678374 | 0.173 | 0.175 | 0.177 |
| 4.885176576331964 | 0.176 | 0.178 | 0.18 |
| 4.888318168985553 | 0.18 | 0.182 | 0.184 |
| 4.891459761639143 | 0.183 | 0.185 | 0.187 |
| 4.894601354292733 | 0.186 | 0.189 | 0.191 |
| 4.897742946946322 | 0.19 | 0.192 | 0.195 |
| 4.900884539599912 | 0.193 | 0.196 | 0.198 |
| 4.904026132253501 | 0.197 | 0.199 | 0.202 |
| 4.907167724907091 | 0.2 | 0.203 | 0.206 |
| 4.91030931756068 | 0.203 | 0.206 | 0.209 |
| 4.91345091021427 | 0.207 | 0.21 | 0.213 |
| 4.91659250286786 | 0.21 | 0.213 | 0.217 |
| 4.91973409552145 | 0.214 | 0.217 | 0.22 |
| 4.922875688175039 | 0.217 | 0.221 | 0.224 |
| 4.926017280828628 | 0.22 | 0.224 | 0.228 |
| 4.929158873482218 | 0.224 | 0.228 | 0.232 |
| 4.932300466135808 | 0.227 | 0.231 | 0.236 |
| 4.935442058789397 | 0.231 | 0.235 | 0.24 |
| 4.938583651442987 | 0.234 | 0.239 | 0.244 |
| 4.941725244096576 | 0.238 | 0.243 | 0.248 |
| 4.944866836750166 | 0.241 | 0.246 | 0.252 |
| 4.948008429403755 | 0.245 | 0.25 | 0.256 |
| 4.951150022057345 | 0.248 | 0.254 | 0.26 |
| 4.954291614710935 | 0.252 | 0.258 | 0.264 |
| 4.957433207364524 | 0.255 | 0.261 | 0.268 |
| 4.960574800018114 | 0.259 | 0.265 | 0.272 |
| 4.963716392671704 | 0.263 | 0.269 | 0.276 |
| 4.966857985325293 | 0.266 | 0.273 | 0.28 |
| 4.969999577978883 | 0.27 | 0.277 | 0.284 |
| 4.973141170632472 | 0.273 | 0.281 | 0.289 |
| 4.976282763286062 | 0.277 | 0.285 | 0.293 |
| 4.979424355939651 | 0.281 | 0.289 | 0.297 |
| 4.982565948593241 | 0.284 | 0.293 | 0.302 |
| 4.985707541246831 | 0.288 | 0.297 | 0.306 |
| 4.98884913390042 | 0.292 | 0.301 | 0.311 |
| 4.99199072655401 | 0.295 | 0.305 | 0.315 |
| 4.9951323192076 | 0.299 | 0.309 | 0.32 |
| 4.99827391186119 | 0.303 | 0.313 | 0.324 |
| 5.00141550451478 | 0.307 | 0.317 | 0.329 |
| 5.004557097168369 | 0.31 | 0.321 | 0.334 |
| 5.007698689821958 | 0.314 | 0.325 | 0.338 |
| 5.010840282475548 | 0.318 | 0.33 | 0.343 |
| 5.013981875129137 | 0.322 | 0.334 | 0.348 |
| 5.017123467782727 | 0.326 | 0.338 | 0.353 |
| 5.020265060436317 | 0.329 | 0.342 | 0.358 |
| 5.023406653089906 | 0.333 | 0.347 | 0.363 |
| 5.026548245743496 | 0.337 | 0.351 | 0.368 |
| 5.029689838397085 | 0.341 | 0.356 | 0.373 |
| 5.032831431050674 | 0.345 | 0.36 | 0.378 |
| 5.035973023704264 | 0.349 | 0.365 | 0.383 |
| 5.039114616357854 | 0.353 | 0.369 | 0.389 |
| 5.042256209011444 | 0.357 | 0.374 | 0.394 |
| 5.045397801665033 | 0.361 | 0.378 | 0.399 |
| 5.048539394318622 | 0.365 | 0.383 | 0.405 |
| 5.051680986972213 | 0.369 | 0.388 | 0.411 |
| 5.054822579625802 | 0.373 | 0.392 | 0.416 |
| 5.057964172279392 | 0.377 | 0.397 | 0.422 |
| 5.061105764932981 | 0.381 | 0.402 | 0.428 |
| 5.064247357586571 | 0.385 | 0.407 | 0.434 |
| 5.067388950240161 | 0.389 | 0.412 | 0.44 |
| 5.07053054289375 | 0.393 | 0.417 | 0.446 |
| 5.07367213554734 | 0.398 | 0.422 | 0.452 |
| 5.07681372820093 | 0.402 | 0.427 | 0.458 |
| 5.079955320854519 | 0.406 | 0.432 | 0.465 |
| 5.083096913508108 | 0.41 | 0.437 | 0.471 |
| 5.086238506161698 | 0.415 | 0.442 | 0.478 |
| 5.089380098815288 | 0.419 | 0.447 | 0.485 |
| 5.092521691468877 | 0.423 | 0.453 | 0.492 |
| 5.095663284122466 | 0.427 | 0.458 | 0.499 |
| 5.098804876776057 | 0.432 | 0.464 | 0.506 |
| 5.101946469429646 | 0.436 | 0.469 | 0.513 |
| 5.105088062083236 | 0.441 | 0.475 | 0.521 |
| 5.108229654736825 | 0.445 | 0.48 | 0.529 |
| 5.111371247390415 | 0.45 | 0.486 | 0.536 |
| 5.114512840044005 | 0.454 | 0.492 | 0.544 |
| 5.117654432697594 | 0.459 | 0.498 | 0.553 |
| 5.120796025351184 | 0.463 | 0.504 | 0.561 |
| 5.123937618004773 | 0.468 | 0.51 | 0.57 |
| 5.127079210658363 | 0.473 | 0.516 | 0.579 |
| 5.130220803311953 | 0.477 | 0.522 | 0.588 |
| 5.133362395965542 | 0.482 | 0.528 | 0.597 |
| 5.136503988619131 | 0.487 | 0.534 | 0.607 |
| 5.13964558127272 | 0.491 | 0.541 | 0.616 |
| 5.142787173926311 | 0.496 | 0.547 | 0.627 |
| 5.1459287665799 | 0.501 | 0.554 | 0.637 |
| 5.14907035923349 | 0.506 | 0.561 | 0.648 |
| 5.15221195188708 | 0.511 | 0.568 | 0.659 |
| 5.15535354454067 | 0.516 | 0.574 | 0.671 |
| 5.158495137194259 | 0.521 | 0.582 | 0.683 |
| 5.161636729847848 | 0.526 | 0.589 | 0.696 |
| 5.164778322501438 | 0.531 | 0.596 | 0.709 |
| 5.167919915155028 | 0.536 | 0.603 | 0.722 |
| 5.171061507808617 | 0.541 | 0.611 | 0.736 |
| 5.174203100462206 | 0.546 | 0.619 | 0.751 |
| 5.177344693115796 | 0.551 | 0.627 | 0.767 |
| 5.180486285769386 | 0.557 | 0.635 | 0.783 |
| 5.183627878422976 | 0.562 | 0.643 | 0.801 |
| 5.186769471076565 | 0.567 | 0.651 | 0.819 |
| 5.189911063730155 | 0.573 | 0.659 | 0.839 |
| 5.193052656383744 | 0.578 | 0.668 | 0.86 |
| 5.196194249037334 | 0.584 | 0.677 | 0.882 |
| 5.199335841690924 | 0.589 | 0.686 | 0.907 |
| 5.202477434344513 | 0.595 | 0.695 | 0.933 |
| 5.205619026998103 | 0.601 | 0.705 | 0.962 |
| 5.208760619651692 | 0.606 | 0.714 | 0.994 |
| 5.211902212305282 | 0.612 | 0.724 | 1.03 |
| 5.215043804958871 | 0.618 | 0.735 | 1.071 |
| 5.218185397612461 | 0.624 | 0.745 | 1.118 |
| 5.221326990266051 | 0.63 | 0.756 | 1.175 |
| 5.22446858291964 | 0.636 | 0.767 | 1.245 |
| 5.22761017557323 | 0.642 | 0.778 | 1.338 |
| 5.23075176822682 | 0.648 | 0.79 | 1.474 |
| 5.23389336088041 | 0.654 | 0.802 | 1.739 |
| 5.237034953533999 | 0.661 | 0.815 | 3 |
| 5.240176546187588 | 0.667 | 0.828 | 1.54 |
| 5.243318138841178 | 0.673 | 0.841 | 1.379 |
| 5.246459731494767 | 0.68 | 0.855 | 1.276 |
| 5.249601324148357 | 0.686 | 0.869 | 1.201 |
| 5.252742916801947 | 0.693 | 0.884 | 1.142 |
| 5.255884509455536 | 0.7 | 0.9 | 1.093 |
| 5.259026102109125 | 0.707 | 0.916 | 1.051 |
| 5.262167694762715 | 0.713 | 0.933 | 1.014 |
| 5.265309287416305 | 0.72 | 0.951 | 0.982 |
| 5.268450880069895 | 0.727 | 0.969 | 0.953 |
| 5.271592472723484 | 0.735 | 0.989 | 0.927 |
| 5.274734065377074 | 0.742 | 1.01 | 0.903 |
| 5.277875658030664 | 0.749 | 1.032 | 0.881 |
| 5.281017250684253 | 0.757 | 1.055 | 0.861 |
| 5.284158843337843 | 0.764 | 1.08 | 0.842 |
| 5.287300435991432 | 0.772 | 1.107 | 0.824 |
| 5.290442028645022 | 0.779 | 1.136 | 0.807 |
| 5.293583621298612 | 0.787 | 1.167 | 0.792 |
| 5.296725213952201 | 0.795 | 1.202 | 0.777 |
| 5.299866806605791 | 0.803 | 1.24 | 0.763 |
| 5.30300839925938 | 0.812 | 1.282 | 0.749 |
| 5.30614999191297 | 0.82 | 1.33 | 0.736 |
| 5.30929158456656 | 0.828 | 1.386 | 0.724 |
| 5.312433177220149 | 0.837 | 1.452 | 0.713 |
| 5.315574769873739 | 0.846 | 1.533 | 0.701 |
| 5.318716362527328 | 0.855 | 1.638 | 0.691 |
| 5.321857955180918 | 0.864 | 1.787 | 0.68 |
| 5.324999547834508 | 0.873 | 2.048 | 0.671 |
| 5.328141140488097 | 0.882 | 2.881 | 0.661 |
| 5.331282733141686 | 0.892 | 1.988 | 0.652 |
| 5.334424325795276 | 0.901 | 1.757 | 0.643 |
| 5.337565918448866 | 0.911 | 1.619 | 0.634 |
| 5.340707511102456 | 0.921 | 1.521 | 0.626 |
| 5.343849103756045 | 0.932 | 1.444 | 0.618 |
| 5.346990696409634 | 0.942 | 1.38 | 0.61 |
| 5.350132289063224 | 0.953 | 1.327 | 0.602 |
| 5.353273881716814 | 0.964 | 1.281 | 0.595 |
| 5.356415474370403 | 0.975 | 1.24 | 0.588 |
| 5.359557067023993 | 0.986 | 1.203 | 0.581 |
| 5.362698659677583 | 0.998 | 1.17 | 0.574 |
| 5.365840252331172 | 1.01 | 1.14 | 0.567 |
| 5.368981844984762 | 1.022 | 1.112 | 0.561 |
| 5.372123437638351 | 1.034 | 1.087 | 0.554 |
| 5.375265030291941 | 1.047 | 1.063 | 0.548 |
| 5.378406622945531 | 1.06 | 1.041 | 0.542 |
| 5.38154821559912 | 1.074 | 1.02 | 0.536 |
| 5.38468980825271 | 1.088 | 1 | 0.53 |
| 5.387831400906299 | 1.102 | 0.981 | 0.525 |
| 5.39097299355989 | 1.116 | 0.963 | 0.519 |
| 5.394114586213479 | 1.131 | 0.947 | 0.514 |
| 5.397256178867068 | 1.147 | 0.93 | 0.509 |
| 5.400397771520657 | 1.163 | 0.915 | 0.503 |
| 5.403539364174247 | 1.179 | 0.901 | 0.498 |
| 5.406680956827837 | 1.196 | 0.886 | 0.493 |
| 5.409822549481426 | 1.214 | 0.873 | 0.489 |
| 5.412964142135016 | 1.232 | 0.86 | 0.484 |
| 5.416105734788605 | 1.251 | 0.847 | 0.479 |
| 5.419247327442195 | 1.271 | 0.835 | 0.474 |
| 5.422388920095785 | 1.292 | 0.824 | 0.47 |
| 5.425530512749375 | 1.313 | 0.813 | 0.465 |
| 5.428672105402964 | 1.335 | 0.802 | 0.461 |
| 5.431813698056554 | 1.359 | 0.791 | 0.457 |
| 5.434955290710143 | 1.383 | 0.781 | 0.453 |
| 5.438096883363733 | 1.409 | 0.771 | 0.448 |
| 5.441238476017322 | 1.436 | 0.761 | 0.444 |
| 5.444380068670912 | 1.464 | 0.752 | 0.44 |
| 5.447521661324502 | 1.495 | 0.743 | 0.436 |
| 5.450663253978091 | 1.527 | 0.734 | 0.432 |
| 5.453804846631681 | 1.562 | 0.725 | 0.429 |
| 5.456946439285271 | 1.599 | 0.717 | 0.425 |
| 5.46008803193886 | 1.639 | 0.709 | 0.421 |
| 5.46322962459245 | 1.682 | 0.701 | 0.417 |
| 5.466371217246039 | 1.73 | 0.693 | 0.414 |
| 5.46951280989963 | 1.783 | 0.685 | 0.41 |
| 5.472654402553218 | 1.842 | 0.678 | 0.407 |
| 5.475795995206808 | 1.908 | 0.67 | 0.403 |
| 5.478937587860398 | 1.986 | 0.663 | 0.4 |
| 5.482079180513987 | 2.077 | 0.656 | 0.396 |
| 5.485220773167577 | 2.188 | 0.649 | 0.393 |
| 5.488362365821166 | 2.332 | 0.643 | 0.39 |
| 5.491503958474756 | 2.535 | 0.636 | 0.387 |
| 5.494645551128346 | 2.882 | 0.63 | 0.383 |
| 5.497787143781935 | 14.613 | 0.623 | 0.38 |
| 5.500928736435525 | 2.882 | 0.617 | 0.377 |
| 5.504070329089115 | 2.535 | 0.611 | 0.374 |
| 5.507211921742704 | 2.332 | 0.605 | 0.371 |
| 5.510353514396294 | 2.188 | 0.599 | 0.368 |
| 5.513495107049883 | 2.077 | 0.593 | 0.365 |
| 5.516636699703473 | 1.986 | 0.588 | 0.362 |
| 5.519778292357062 | 1.908 | 0.582 | 0.359 |
| 5.522919885010652 | 1.842 | 0.576 | 0.356 |
| 5.526061477664242 | 1.783 | 0.571 | 0.353 |
| 5.529203070317831 | 1.73 | 0.566 | 0.351 |
| 5.532344662971421 | 1.682 | 0.56 | 0.348 |
| 5.535486255625011 | 1.639 | 0.555 | 0.345 |
| 5.5386278482786 | 1.599 | 0.55 | 0.342 |
| 5.54176944093219 | 1.562 | 0.545 | 0.34 |
| 5.544911033585779 | 1.527 | 0.54 | 0.337 |
| 5.54805262623937 | 1.495 | 0.535 | 0.334 |
| 5.551194218892959 | 1.464 | 0.531 | 0.332 |
| 5.554335811546548 | 1.436 | 0.526 | 0.329 |
| 5.557477404200137 | 1.409 | 0.521 | 0.327 |
| 5.560618996853727 | 1.383 | 0.517 | 0.324 |
| 5.563760589507317 | 1.359 | 0.512 | 0.322 |
| 5.566902182160906 | 1.335 | 0.508 | 0.319 |
| 5.570043774814496 | 1.313 | 0.503 | 0.317 |
| 5.573185367468086 | 1.292 | 0.499 | 0.314 |
| 5.576326960121675 | 1.271 | 0.494 | 0.312 |
| 5.579468552775264 | 1.251 | 0.49 | 0.309 |
| 5.582610145428854 | 1.232 | 0.486 | 0.307 |
| 5.585751738082444 | 1.214 | 0.482 | 0.305 |
| 5.588893330736034 | 1.196 | 0.478 | 0.302 |
| 5.592034923389623 | 1.179 | 0.474 | 0.3 |
| 5.595176516043213 | 1.163 | 0.47 | 0.298 |
| 5.598318108696803 | 1.147 | 0.466 | 0.296 |
| 5.601459701350392 | 1.131 | 0.462 | 0.293 |
| 5.604601294003982 | 1.116 | 0.458 | 0.291 |
| 5.607742886657571 | 1.102 | 0.454 | 0.289 |
| 5.610884479311161 | 1.088 | 0.45 | 0.287 |
| 5.61402607196475 | 1.074 | 0.447 | 0.285 |
| 5.61716766461834 | 1.06 | 0.443 | 0.283 |
| 5.62030925727193 | 1.047 | 0.439 | 0.28 |
| 5.623450849925519 | 1.034 | 0.436 | 0.278 |
| 5.626592442579109 | 1.022 | 0.432 | 0.276 |
| 5.629734035232698 | 1.01 | 0.429 | 0.274 |
| 5.632875627886288 | 0.998 | 0.425 | 0.272 |
| 5.636017220539878 | 0.986 | 0.422 | 0.27 |
| 5.639158813193467 | 0.975 | 0.418 | 0.268 |
| 5.642300405847057 | 0.964 | 0.415 | 0.266 |
| 5.645441998500646 | 0.953 | 0.411 | 0.264 |
| 5.648583591154236 | 0.942 | 0.408 | 0.262 |
| 5.651725183807825 | 0.932 | 0.405 | 0.26 |
| 5.654866776461415 | 0.921 | 0.401 | 0.258 |
| 5.658008369115005 | 0.911 | 0.398 | 0.256 |
| 5.661149961768594 | 0.901 | 0.395 | 0.254 |
| 5.664291554422184 | 0.892 | 0.392 | 0.252 |
| 5.667433147075774 | 0.882 | 0.389 | 0.25 |
| 5.670574739729363 | 0.873 | 0.386 | 0.249 |
| 5.673716332382953 | 0.864 | 0.382 | 0.247 |
| 5.676857925036542 | 0.855 | 0.379 | 0.245 |
| 5.679999517690132 | 0.846 | 0.376 | 0.243 |
| 5.683141110343721 | 0.837 | 0.373 | 0.241 |
| 5.686282702997311 | 0.828 | 0.37 | 0.239 |
| 5.689424295650901 | 0.82 | 0.367 | 0.238 |
| 5.69256588830449 | 0.812 | 0.364 | 0.236 |
| 5.69570748095808 | 0.803 | 0.361 | 0.234 |
| 5.69884907361167 | 0.795 | 0.359 | 0.232 |
| 5.701990666265259 | 0.787 | 0.356 | 0.23 |
| 5.705132258918849 | 0.779 | 0.353 | 0.229 |
| 5.708273851572438 | 0.772 | 0.35 | 0.227 |
| 5.711415444226028 | 0.764 | 0.347 | 0.225 |
| 5.714557036879618 | 0.757 | 0.344 | 0.224 |
| 5.717698629533207 | 0.749 | 0.342 | 0.222 |
| 5.720840222186797 | 0.742 | 0.339 | 0.22 |
| 5.723981814840386 | 0.735 | 0.336 | 0.218 |
| 5.727123407493976 | 0.727 | 0.333 | 0.217 |
| 5.730265000147565 | 0.72 | 0.331 | 0.215 |
| 5.733406592801155 | 0.713 | 0.328 | 0.213 |
| 5.736548185454744 | 0.707 | 0.325 | 0.212 |
| 5.739689778108334 | 0.7 | 0.323 | 0.21 |
| 5.742831370761924 | 0.693 | 0.32 | 0.209 |
| 5.745972963415514 | 0.686 | 0.318 | 0.207 |
| 5.749114556069103 | 0.68 | 0.315 | 0.205 |
| 5.752256148722693 | 0.673 | 0.312 | 0.204 |
| 5.755397741376282 | 0.667 | 0.31 | 0.202 |
| 5.758539334029872 | 0.661 | 0.307 | 0.201 |
| 5.761680926683462 | 0.654 | 0.305 | 0.199 |
| 5.764822519337051 | 0.648 | 0.302 | 0.197 |
| 5.767964111990641 | 0.642 | 0.3 | 0.196 |
| 5.77110570464423 | 0.636 | 0.297 | 0.194 |
| 5.77424729729782 | 0.63 | 0.295 | 0.193 |
| 5.77738888995141 | 0.624 | 0.293 | 0.191 |
| 5.780530482605 | 0.618 | 0.29 | 0.19 |
| 5.783672075258588 | 0.612 | 0.288 | 0.188 |
| 5.786813667912178 | 0.606 | 0.285 | 0.187 |
| 5.789955260565768 | 0.601 | 0.283 | 0.185 |
| 5.793096853219358 | 0.595 | 0.281 | 0.184 |
| 5.796238445872947 | 0.589 | 0.278 | 0.182 |
| 5.799380038526537 | 0.584 | 0.276 | 0.181 |
| 5.802521631180126 | 0.578 | 0.274 | 0.179 |
| 5.805663223833715 | 0.573 | 0.271 | 0.178 |
| 5.808804816487306 | 0.567 | 0.269 | 0.176 |
| 5.811946409140895 | 0.562 | 0.267 | 0.175 |
| 5.815088001794485 | 0.557 | 0.264 | 0.174 |
| 5.818229594448074 | 0.551 | 0.262 | 0.172 |
| 5.821371187101663 | 0.546 | 0.26 | 0.171 |
| 5.824512779755254 | 0.541 | 0.258 | 0.169 |
| 5.827654372408843 | 0.536 | 0.256 | 0.168 |
| 5.830795965062433 | 0.531 | 0.253 | 0.166 |
| 5.833937557716022 | 0.526 | 0.251 | 0.165 |
| 5.837079150369612 | 0.521 | 0.249 | 0.164 |
| 5.840220743023201 | 0.516 | 0.247 | 0.162 |
| 5.843362335676791 | 0.511 | 0.245 | 0.161 |
| 5.846503928330381 | 0.506 | 0.242 | 0.16 |
| 5.84964552098397 | 0.501 | 0.24 | 0.158 |
| 5.85278711363756 | 0.496 | 0.238 | 0.157 |
| 5.85592870629115 | 0.491 | 0.236 | 0.155 |
| 5.85907029894474 | 0.487 | 0.234 | 0.154 |
| 5.862211891598329 | 0.482 | 0.232 | 0.153 |
| 5.865353484251918 | 0.477 | 0.23 | 0.151 |
| 5.868495076905508 | 0.473 | 0.228 | 0.15 |
| 5.871636669559098 | 0.468 | 0.226 | 0.149 |
| 5.874778262212687 | 0.463 | 0.224 | 0.147 |
| 5.877919854866277 | 0.459 | 0.221 | 0.146 |
| 5.881061447519866 | 0.454 | 0.219 | 0.145 |
| 5.884203040173456 | 0.45 | 0.217 | 0.143 |
| 5.887344632827046 | 0.445 | 0.215 | 0.142 |
| 5.890486225480635 | 0.441 | 0.213 | 0.141 |
| 5.893627818134224 | 0.436 | 0.211 | 0.139 |
| 5.896769410787814 | 0.432 | 0.209 | 0.138 |
| 5.899911003441404 | 0.427 | 0.207 | 0.137 |
| 5.903052596094994 | 0.423 | 0.205 | 0.136 |
| 5.906194188748583 | 0.419 | 0.203 | 0.134 |
| 5.909335781402172 | 0.415 | 0.201 | 0.133 |
| 5.912477374055762 | 0.41 | 0.199 | 0.132 |
| 5.915618966709352 | 0.406 | 0.198 | 0.131 |
| 5.918760559362942 | 0.402 | 0.196 | 0.129 |
| 5.921902152016531 | 0.398 | 0.194 | 0.128 |
| 5.92504374467012 | 0.393 | 0.192 | 0.127 |
| 5.92818533732371 | 0.389 | 0.19 | 0.126 |
| 5.9313269299773 | 0.385 | 0.188 | 0.124 |
| 5.93446852263089 | 0.381 | 0.186 | 0.123 |
| 5.93761011528448 | 0.377 | 0.184 | 0.122 |
| 5.940751707938068 | 0.373 | 0.182 | 0.121 |
| 5.943893300591658 | 0.369 | 0.18 | 0.119 |
| 5.947034893245248 | 0.365 | 0.178 | 0.118 |
| 5.950176485898837 | 0.361 | 0.177 | 0.117 |
| 5.953318078552427 | 0.357 | 0.175 | 0.116 |
| 5.956459671206017 | 0.353 | 0.173 | 0.114 |
| 5.959601263859606 | 0.349 | 0.171 | 0.113 |
| 5.962742856513196 | 0.345 | 0.169 | 0.112 |
| 5.965884449166785 | 0.341 | 0.167 | 0.111 |
| 5.969026041820375 | 0.337 | 0.165 | 0.11 |
| 5.972167634473964 | 0.333 | 0.164 | 0.108 |
| 5.975309227127554 | 0.329 | 0.162 | 0.107 |
| 5.978450819781144 | 0.326 | 0.16 | 0.106 |
| 5.981592412434733 | 0.322 | 0.158 | 0.105 |
| 5.984734005088323 | 0.318 | 0.156 | 0.104 |
| 5.987875597741913 | 0.314 | 0.155 | 0.102 |
| 5.991017190395502 | 0.31 | 0.153 | 0.101 |
| 5.994158783049092 | 0.307 | 0.151 | 0.1 |
| 5.997300375702681 | 0.303 | 0.149 | 0.099 |
| 6.000441968356271 | 0.299 | 0.147 | 0.098 |
| 6.003583561009861 | 0.295 | 0.146 | 0.097 |
| 6.00672515366345 | 0.292 | 0.144 | 0.095 |
| 6.00986674631704 | 0.288 | 0.142 | 0.094 |
| 6.01300833897063 | 0.284 | 0.14 | 0.093 |
| 6.01614993162422 | 0.281 | 0.139 | 0.092 |
| 6.019291524277808 | 0.277 | 0.137 | 0.091 |
| 6.022433116931398 | 0.273 | 0.135 | 0.09 |
| 6.025574709584988 | 0.27 | 0.133 | 0.089 |
| 6.028716302238577 | 0.266 | 0.132 | 0.087 |
| 6.031857894892167 | 0.263 | 0.13 | 0.086 |
| 6.034999487545757 | 0.259 | 0.128 | 0.085 |
| 6.038141080199346 | 0.255 | 0.126 | 0.084 |
| 6.041282672852935 | 0.252 | 0.125 | 0.083 |
| 6.044424265506525 | 0.248 | 0.123 | 0.082 |
| 6.047565858160115 | 0.245 | 0.121 | 0.081 |
| 6.050707450813704 | 0.241 | 0.12 | 0.079 |
| 6.053849043467294 | 0.238 | 0.118 | 0.078 |
| 6.056990636120884 | 0.234 | 0.116 | 0.077 |
| 6.060132228774473 | 0.231 | 0.114 | 0.076 |
| 6.063273821428063 | 0.227 | 0.113 | 0.075 |
| 6.066415414081653 | 0.224 | 0.111 | 0.074 |
| 6.069557006735242 | 0.22 | 0.109 | 0.073 |
| 6.072698599388831 | 0.217 | 0.108 | 0.072 |
| 6.07584019204242 | 0.214 | 0.106 | 0.07 |
| 6.078981784696011 | 0.21 | 0.104 | 0.069 |
| 6.082123377349601 | 0.207 | 0.103 | 0.068 |
| 6.08526497000319 | 0.203 | 0.101 | 0.067 |
| 6.08840656265678 | 0.2 | 0.099 | 0.066 |
| 6.09154815531037 | 0.197 | 0.098 | 0.065 |
| 6.094689747963959 | 0.193 | 0.096 | 0.064 |
| 6.097831340617549 | 0.19 | 0.094 | 0.063 |
| 6.100972933271138 | 0.186 | 0.093 | 0.062 |
| 6.104114525924728 | 0.183 | 0.091 | 0.061 |
| 6.107256118578317 | 0.18 | 0.089 | 0.059 |
| 6.110397711231907 | 0.176 | 0.088 | 0.058 |
| 6.113539303885497 | 0.173 | 0.086 | 0.057 |
| 6.116680896539086 | 0.17 | 0.084 | 0.056 |
| 6.119822489192675 | 0.166 | 0.083 | 0.055 |
| 6.122964081846265 | 0.163 | 0.081 | 0.054 |
| 6.126105674499855 | 0.16 | 0.08 | 0.053 |
| 6.129247267153445 | 0.156 | 0.078 | 0.052 |
| 6.132388859807034 | 0.153 | 0.076 | 0.051 |
| 6.135530452460624 | 0.15 | 0.075 | 0.05 |
| 6.138672045114213 | 0.147 | 0.073 | 0.049 |
| 6.141813637767803 | 0.143 | 0.071 | 0.048 |
| 6.144955230421393 | 0.14 | 0.07 | 0.046 |
| 6.148096823074982 | 0.137 | 0.068 | 0.045 |
| 6.151238415728571 | 0.134 | 0.067 | 0.044 |
| 6.154380008382161 | 0.13 | 0.065 | 0.043 |
| 6.157521601035751 | 0.127 | 0.063 | 0.042 |
| 6.16066319368934 | 0.124 | 0.062 | 0.041 |
| 6.16380478634293 | 0.121 | 0.06 | 0.04 |
| 6.16694637899652 | 0.117 | 0.059 | 0.039 |
| 6.170087971650109 | 0.114 | 0.057 | 0.038 |
| 6.173229564303698 | 0.111 | 0.055 | 0.037 |
| 6.176371156957289 | 0.108 | 0.054 | 0.036 |
| 6.179512749610878 | 0.104 | 0.052 | 0.035 |
| 6.182654342264468 | 0.101 | 0.051 | 0.034 |
| 6.185795934918057 | 0.098 | 0.049 | 0.033 |
| 6.188937527571647 | 0.095 | 0.047 | 0.032 |
| 6.192079120225237 | 0.092 | 0.046 | 0.03 |
| 6.195220712878826 | 0.088 | 0.044 | 0.029 |
| 6.198362305532415 | 0.085 | 0.043 | 0.028 |
| 6.201503898186005 | 0.082 | 0.041 | 0.027 |
| 6.204645490839594 | 0.079 | 0.039 | 0.026 |
| 6.207787083493184 | 0.076 | 0.038 | 0.025 |
| 6.210928676146774 | 0.073 | 0.036 | 0.024 |
| 6.214070268800364 | 0.069 | 0.035 | 0.023 |
| 6.217211861453953 | 0.066 | 0.033 | 0.022 |
| 6.220353454107543 | 0.063 | 0.031 | 0.021 |
| 6.223495046761133 | 0.06 | 0.03 | 0.02 |
| 6.226636639414722 | 0.057 | 0.028 | 0.019 |
| 6.229778232068312 | 0.054 | 0.027 | 0.018 |
| 6.232919824721901 | 0.05 | 0.025 | 0.017 |
| 6.236061417375491 | 0.047 | 0.024 | 0.016 |
| 6.23920301002908 | 0.044 | 0.022 | 0.015 |
| 6.24234460268267 | 0.041 | 0.02 | 0.014 |
| 6.24548619533626 | 0.038 | 0.019 | 0.013 |
| 6.24862778798985 | 0.035 | 0.017 | 0.012 |
| 6.251769380643438 | 0.031 | 0.016 | 0.01 |
| 6.254910973297028 | 0.028 | 0.014 | 0.009 |
| 6.258052565950618 | 0.025 | 0.013 | 0.008 |
| 6.261194158604208 | 0.022 | 0.011 | 0.007 |
| 6.264335751257797 | 0.019 | 0.009 | 0.006 |
| 6.267477343911387 | 0.016 | 0.008 | 0.005 |
| 6.270618936564976 | 0.013 | 0.006 | 0.004 |
| 6.273760529218566 | 0.009 | 0.005 | 0.003 |
| 6.276902121872155 | 0.006 | 0.003 | 0.002 |
| 6.280043714525745 | 0.003 | 0.002 | 0.001 |
| 6.283185307179335 | 0 | 0 | 0 |